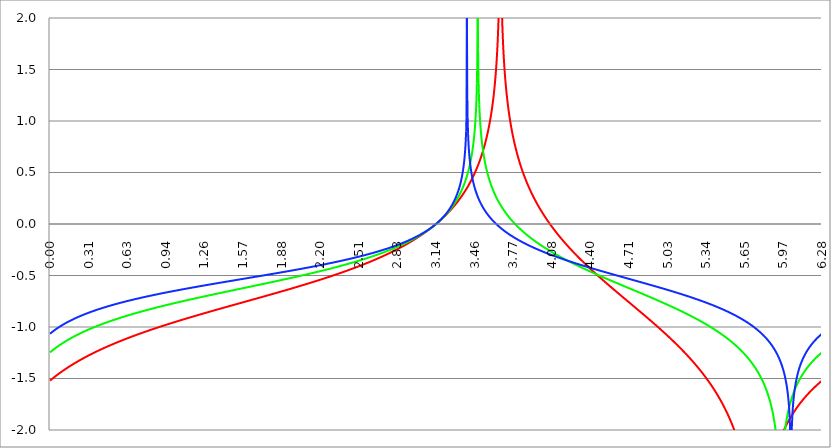
| Category | Series 1 | Series 0 | Series 2 |
|---|---|---|---|
| 0.0 | -1.521 | -1.246 | -1.066 |
| 0.00314159265358979 | -1.518 | -1.243 | -1.062 |
| 0.00628318530717958 | -1.514 | -1.24 | -1.059 |
| 0.00942477796076938 | -1.511 | -1.237 | -1.056 |
| 0.0125663706143592 | -1.508 | -1.234 | -1.053 |
| 0.015707963267949 | -1.505 | -1.231 | -1.05 |
| 0.0188495559215388 | -1.502 | -1.228 | -1.047 |
| 0.0219911485751285 | -1.499 | -1.225 | -1.044 |
| 0.0251327412287183 | -1.496 | -1.222 | -1.042 |
| 0.0282743338823081 | -1.493 | -1.219 | -1.039 |
| 0.0314159265358979 | -1.49 | -1.216 | -1.036 |
| 0.0345575191894877 | -1.487 | -1.214 | -1.033 |
| 0.0376991118430775 | -1.484 | -1.211 | -1.03 |
| 0.0408407044966673 | -1.481 | -1.208 | -1.028 |
| 0.0439822971502571 | -1.479 | -1.205 | -1.025 |
| 0.0471238898038469 | -1.476 | -1.202 | -1.022 |
| 0.0502654824574367 | -1.473 | -1.2 | -1.02 |
| 0.0534070751110265 | -1.47 | -1.197 | -1.017 |
| 0.0565486677646163 | -1.467 | -1.194 | -1.015 |
| 0.059690260418206 | -1.464 | -1.192 | -1.012 |
| 0.0628318530717958 | -1.462 | -1.189 | -1.01 |
| 0.0659734457253856 | -1.459 | -1.186 | -1.007 |
| 0.0691150383789754 | -1.456 | -1.184 | -1.005 |
| 0.0722566310325652 | -1.453 | -1.181 | -1.002 |
| 0.075398223686155 | -1.45 | -1.178 | -1 |
| 0.0785398163397448 | -1.448 | -1.176 | -0.997 |
| 0.0816814089933346 | -1.445 | -1.173 | -0.995 |
| 0.0848230016469244 | -1.442 | -1.171 | -0.993 |
| 0.0879645943005142 | -1.44 | -1.168 | -0.99 |
| 0.091106186954104 | -1.437 | -1.166 | -0.988 |
| 0.0942477796076937 | -1.434 | -1.163 | -0.986 |
| 0.0973893722612835 | -1.432 | -1.161 | -0.983 |
| 0.100530964914873 | -1.429 | -1.159 | -0.981 |
| 0.103672557568463 | -1.426 | -1.156 | -0.979 |
| 0.106814150222053 | -1.424 | -1.154 | -0.977 |
| 0.109955742875643 | -1.421 | -1.151 | -0.974 |
| 0.113097335529233 | -1.419 | -1.149 | -0.972 |
| 0.116238928182822 | -1.416 | -1.147 | -0.97 |
| 0.119380520836412 | -1.414 | -1.144 | -0.968 |
| 0.122522113490002 | -1.411 | -1.142 | -0.966 |
| 0.125663706143592 | -1.409 | -1.14 | -0.964 |
| 0.128805298797181 | -1.406 | -1.138 | -0.962 |
| 0.131946891450771 | -1.404 | -1.135 | -0.96 |
| 0.135088484104361 | -1.401 | -1.133 | -0.958 |
| 0.138230076757951 | -1.399 | -1.131 | -0.955 |
| 0.141371669411541 | -1.396 | -1.129 | -0.953 |
| 0.14451326206513 | -1.394 | -1.126 | -0.951 |
| 0.14765485471872 | -1.391 | -1.124 | -0.949 |
| 0.15079644737231 | -1.389 | -1.122 | -0.948 |
| 0.1539380400259 | -1.386 | -1.12 | -0.946 |
| 0.15707963267949 | -1.384 | -1.118 | -0.944 |
| 0.160221225333079 | -1.382 | -1.116 | -0.942 |
| 0.163362817986669 | -1.379 | -1.113 | -0.94 |
| 0.166504410640259 | -1.377 | -1.111 | -0.938 |
| 0.169646003293849 | -1.375 | -1.109 | -0.936 |
| 0.172787595947439 | -1.372 | -1.107 | -0.934 |
| 0.175929188601028 | -1.37 | -1.105 | -0.932 |
| 0.179070781254618 | -1.368 | -1.103 | -0.93 |
| 0.182212373908208 | -1.365 | -1.101 | -0.929 |
| 0.185353966561798 | -1.363 | -1.099 | -0.927 |
| 0.188495559215388 | -1.361 | -1.097 | -0.925 |
| 0.191637151868977 | -1.358 | -1.095 | -0.923 |
| 0.194778744522567 | -1.356 | -1.093 | -0.921 |
| 0.197920337176157 | -1.354 | -1.091 | -0.92 |
| 0.201061929829747 | -1.352 | -1.089 | -0.918 |
| 0.204203522483336 | -1.349 | -1.087 | -0.916 |
| 0.207345115136926 | -1.347 | -1.085 | -0.914 |
| 0.210486707790516 | -1.345 | -1.083 | -0.913 |
| 0.213628300444106 | -1.343 | -1.081 | -0.911 |
| 0.216769893097696 | -1.341 | -1.079 | -0.909 |
| 0.219911485751285 | -1.338 | -1.077 | -0.908 |
| 0.223053078404875 | -1.336 | -1.076 | -0.906 |
| 0.226194671058465 | -1.334 | -1.074 | -0.904 |
| 0.229336263712055 | -1.332 | -1.072 | -0.903 |
| 0.232477856365645 | -1.33 | -1.07 | -0.901 |
| 0.235619449019234 | -1.328 | -1.068 | -0.899 |
| 0.238761041672824 | -1.325 | -1.066 | -0.898 |
| 0.241902634326414 | -1.323 | -1.064 | -0.896 |
| 0.245044226980004 | -1.321 | -1.063 | -0.895 |
| 0.248185819633594 | -1.319 | -1.061 | -0.893 |
| 0.251327412287183 | -1.317 | -1.059 | -0.891 |
| 0.254469004940773 | -1.315 | -1.057 | -0.89 |
| 0.257610597594363 | -1.313 | -1.055 | -0.888 |
| 0.260752190247953 | -1.311 | -1.054 | -0.887 |
| 0.263893782901543 | -1.309 | -1.052 | -0.885 |
| 0.267035375555132 | -1.307 | -1.05 | -0.884 |
| 0.270176968208722 | -1.304 | -1.048 | -0.882 |
| 0.273318560862312 | -1.302 | -1.047 | -0.881 |
| 0.276460153515902 | -1.3 | -1.045 | -0.879 |
| 0.279601746169492 | -1.298 | -1.043 | -0.878 |
| 0.282743338823082 | -1.296 | -1.041 | -0.876 |
| 0.285884931476671 | -1.294 | -1.04 | -0.875 |
| 0.289026524130261 | -1.292 | -1.038 | -0.873 |
| 0.292168116783851 | -1.29 | -1.036 | -0.872 |
| 0.295309709437441 | -1.288 | -1.035 | -0.87 |
| 0.298451302091031 | -1.286 | -1.033 | -0.869 |
| 0.30159289474462 | -1.284 | -1.031 | -0.867 |
| 0.30473448739821 | -1.282 | -1.03 | -0.866 |
| 0.3078760800518 | -1.28 | -1.028 | -0.864 |
| 0.31101767270539 | -1.278 | -1.026 | -0.863 |
| 0.31415926535898 | -1.277 | -1.025 | -0.862 |
| 0.31730085801257 | -1.275 | -1.023 | -0.86 |
| 0.320442450666159 | -1.273 | -1.021 | -0.859 |
| 0.323584043319749 | -1.271 | -1.02 | -0.857 |
| 0.326725635973339 | -1.269 | -1.018 | -0.856 |
| 0.329867228626929 | -1.267 | -1.017 | -0.855 |
| 0.333008821280519 | -1.265 | -1.015 | -0.853 |
| 0.336150413934108 | -1.263 | -1.013 | -0.852 |
| 0.339292006587698 | -1.261 | -1.012 | -0.851 |
| 0.342433599241288 | -1.259 | -1.01 | -0.849 |
| 0.345575191894878 | -1.257 | -1.009 | -0.848 |
| 0.348716784548468 | -1.256 | -1.007 | -0.847 |
| 0.351858377202058 | -1.254 | -1.006 | -0.845 |
| 0.354999969855647 | -1.252 | -1.004 | -0.844 |
| 0.358141562509237 | -1.25 | -1.003 | -0.843 |
| 0.361283155162827 | -1.248 | -1.001 | -0.841 |
| 0.364424747816417 | -1.246 | -1 | -0.84 |
| 0.367566340470007 | -1.245 | -0.998 | -0.839 |
| 0.370707933123597 | -1.243 | -0.997 | -0.838 |
| 0.373849525777186 | -1.241 | -0.995 | -0.836 |
| 0.376991118430776 | -1.239 | -0.994 | -0.835 |
| 0.380132711084366 | -1.237 | -0.992 | -0.834 |
| 0.383274303737956 | -1.235 | -0.991 | -0.832 |
| 0.386415896391546 | -1.234 | -0.989 | -0.831 |
| 0.389557489045135 | -1.232 | -0.988 | -0.83 |
| 0.392699081698725 | -1.23 | -0.986 | -0.829 |
| 0.395840674352315 | -1.228 | -0.985 | -0.827 |
| 0.398982267005905 | -1.227 | -0.983 | -0.826 |
| 0.402123859659495 | -1.225 | -0.982 | -0.825 |
| 0.405265452313085 | -1.223 | -0.98 | -0.824 |
| 0.408407044966674 | -1.221 | -0.979 | -0.823 |
| 0.411548637620264 | -1.22 | -0.977 | -0.821 |
| 0.414690230273854 | -1.218 | -0.976 | -0.82 |
| 0.417831822927444 | -1.216 | -0.975 | -0.819 |
| 0.420973415581034 | -1.214 | -0.973 | -0.818 |
| 0.424115008234623 | -1.213 | -0.972 | -0.817 |
| 0.427256600888213 | -1.211 | -0.97 | -0.815 |
| 0.430398193541803 | -1.209 | -0.969 | -0.814 |
| 0.433539786195393 | -1.207 | -0.968 | -0.813 |
| 0.436681378848983 | -1.206 | -0.966 | -0.812 |
| 0.439822971502573 | -1.204 | -0.965 | -0.811 |
| 0.442964564156162 | -1.202 | -0.963 | -0.81 |
| 0.446106156809752 | -1.201 | -0.962 | -0.808 |
| 0.449247749463342 | -1.199 | -0.961 | -0.807 |
| 0.452389342116932 | -1.197 | -0.959 | -0.806 |
| 0.455530934770522 | -1.196 | -0.958 | -0.805 |
| 0.458672527424111 | -1.194 | -0.957 | -0.804 |
| 0.461814120077701 | -1.192 | -0.955 | -0.803 |
| 0.464955712731291 | -1.191 | -0.954 | -0.802 |
| 0.468097305384881 | -1.189 | -0.953 | -0.8 |
| 0.471238898038471 | -1.187 | -0.951 | -0.799 |
| 0.474380490692061 | -1.186 | -0.95 | -0.798 |
| 0.47752208334565 | -1.184 | -0.949 | -0.797 |
| 0.48066367599924 | -1.182 | -0.947 | -0.796 |
| 0.48380526865283 | -1.181 | -0.946 | -0.795 |
| 0.48694686130642 | -1.179 | -0.945 | -0.794 |
| 0.49008845396001 | -1.178 | -0.943 | -0.793 |
| 0.493230046613599 | -1.176 | -0.942 | -0.792 |
| 0.496371639267189 | -1.174 | -0.941 | -0.79 |
| 0.499513231920779 | -1.173 | -0.94 | -0.789 |
| 0.502654824574369 | -1.171 | -0.938 | -0.788 |
| 0.505796417227959 | -1.17 | -0.937 | -0.787 |
| 0.508938009881549 | -1.168 | -0.936 | -0.786 |
| 0.512079602535138 | -1.166 | -0.934 | -0.785 |
| 0.515221195188728 | -1.165 | -0.933 | -0.784 |
| 0.518362787842318 | -1.163 | -0.932 | -0.783 |
| 0.521504380495908 | -1.162 | -0.931 | -0.782 |
| 0.524645973149498 | -1.16 | -0.929 | -0.781 |
| 0.527787565803087 | -1.158 | -0.928 | -0.78 |
| 0.530929158456677 | -1.157 | -0.927 | -0.779 |
| 0.534070751110267 | -1.155 | -0.926 | -0.778 |
| 0.537212343763857 | -1.154 | -0.924 | -0.777 |
| 0.540353936417447 | -1.152 | -0.923 | -0.776 |
| 0.543495529071037 | -1.151 | -0.922 | -0.775 |
| 0.546637121724626 | -1.149 | -0.921 | -0.774 |
| 0.549778714378216 | -1.148 | -0.919 | -0.773 |
| 0.552920307031806 | -1.146 | -0.918 | -0.772 |
| 0.556061899685396 | -1.145 | -0.917 | -0.771 |
| 0.559203492338986 | -1.143 | -0.916 | -0.77 |
| 0.562345084992576 | -1.141 | -0.915 | -0.769 |
| 0.565486677646165 | -1.14 | -0.913 | -0.768 |
| 0.568628270299755 | -1.138 | -0.912 | -0.767 |
| 0.571769862953345 | -1.137 | -0.911 | -0.766 |
| 0.574911455606935 | -1.135 | -0.91 | -0.765 |
| 0.578053048260525 | -1.134 | -0.909 | -0.764 |
| 0.581194640914114 | -1.132 | -0.907 | -0.763 |
| 0.584336233567704 | -1.131 | -0.906 | -0.762 |
| 0.587477826221294 | -1.129 | -0.905 | -0.761 |
| 0.590619418874884 | -1.128 | -0.904 | -0.76 |
| 0.593761011528474 | -1.126 | -0.903 | -0.759 |
| 0.596902604182064 | -1.125 | -0.901 | -0.758 |
| 0.600044196835653 | -1.124 | -0.9 | -0.757 |
| 0.603185789489243 | -1.122 | -0.899 | -0.756 |
| 0.606327382142833 | -1.121 | -0.898 | -0.755 |
| 0.609468974796423 | -1.119 | -0.897 | -0.754 |
| 0.612610567450013 | -1.118 | -0.896 | -0.753 |
| 0.615752160103602 | -1.116 | -0.895 | -0.752 |
| 0.618893752757192 | -1.115 | -0.893 | -0.751 |
| 0.622035345410782 | -1.113 | -0.892 | -0.75 |
| 0.625176938064372 | -1.112 | -0.891 | -0.749 |
| 0.628318530717962 | -1.11 | -0.89 | -0.748 |
| 0.631460123371551 | -1.109 | -0.889 | -0.747 |
| 0.634601716025141 | -1.107 | -0.888 | -0.746 |
| 0.637743308678731 | -1.106 | -0.887 | -0.745 |
| 0.640884901332321 | -1.105 | -0.885 | -0.745 |
| 0.644026493985911 | -1.103 | -0.884 | -0.744 |
| 0.647168086639501 | -1.102 | -0.883 | -0.743 |
| 0.65030967929309 | -1.1 | -0.882 | -0.742 |
| 0.65345127194668 | -1.099 | -0.881 | -0.741 |
| 0.65659286460027 | -1.098 | -0.88 | -0.74 |
| 0.65973445725386 | -1.096 | -0.879 | -0.739 |
| 0.66287604990745 | -1.095 | -0.878 | -0.738 |
| 0.666017642561039 | -1.093 | -0.877 | -0.737 |
| 0.669159235214629 | -1.092 | -0.875 | -0.736 |
| 0.672300827868219 | -1.09 | -0.874 | -0.735 |
| 0.675442420521809 | -1.089 | -0.873 | -0.735 |
| 0.678584013175399 | -1.088 | -0.872 | -0.734 |
| 0.681725605828989 | -1.086 | -0.871 | -0.733 |
| 0.684867198482578 | -1.085 | -0.87 | -0.732 |
| 0.688008791136168 | -1.084 | -0.869 | -0.731 |
| 0.691150383789758 | -1.082 | -0.868 | -0.73 |
| 0.694291976443348 | -1.081 | -0.867 | -0.729 |
| 0.697433569096938 | -1.079 | -0.866 | -0.728 |
| 0.700575161750528 | -1.078 | -0.865 | -0.727 |
| 0.703716754404117 | -1.077 | -0.864 | -0.727 |
| 0.706858347057707 | -1.075 | -0.862 | -0.726 |
| 0.709999939711297 | -1.074 | -0.861 | -0.725 |
| 0.713141532364887 | -1.073 | -0.86 | -0.724 |
| 0.716283125018477 | -1.071 | -0.859 | -0.723 |
| 0.719424717672066 | -1.07 | -0.858 | -0.722 |
| 0.722566310325656 | -1.068 | -0.857 | -0.721 |
| 0.725707902979246 | -1.067 | -0.856 | -0.72 |
| 0.728849495632836 | -1.066 | -0.855 | -0.72 |
| 0.731991088286426 | -1.064 | -0.854 | -0.719 |
| 0.735132680940016 | -1.063 | -0.853 | -0.718 |
| 0.738274273593605 | -1.062 | -0.852 | -0.717 |
| 0.741415866247195 | -1.06 | -0.851 | -0.716 |
| 0.744557458900785 | -1.059 | -0.85 | -0.715 |
| 0.747699051554375 | -1.058 | -0.849 | -0.715 |
| 0.750840644207965 | -1.056 | -0.848 | -0.714 |
| 0.753982236861554 | -1.055 | -0.847 | -0.713 |
| 0.757123829515144 | -1.054 | -0.846 | -0.712 |
| 0.760265422168734 | -1.052 | -0.845 | -0.711 |
| 0.763407014822324 | -1.051 | -0.844 | -0.71 |
| 0.766548607475914 | -1.05 | -0.843 | -0.709 |
| 0.769690200129504 | -1.048 | -0.842 | -0.709 |
| 0.772831792783093 | -1.047 | -0.841 | -0.708 |
| 0.775973385436683 | -1.046 | -0.84 | -0.707 |
| 0.779114978090273 | -1.045 | -0.839 | -0.706 |
| 0.782256570743863 | -1.043 | -0.838 | -0.705 |
| 0.785398163397453 | -1.042 | -0.837 | -0.705 |
| 0.788539756051042 | -1.041 | -0.836 | -0.704 |
| 0.791681348704632 | -1.039 | -0.835 | -0.703 |
| 0.794822941358222 | -1.038 | -0.834 | -0.702 |
| 0.797964534011812 | -1.037 | -0.833 | -0.701 |
| 0.801106126665402 | -1.035 | -0.832 | -0.7 |
| 0.804247719318992 | -1.034 | -0.831 | -0.7 |
| 0.807389311972581 | -1.033 | -0.83 | -0.699 |
| 0.810530904626171 | -1.032 | -0.829 | -0.698 |
| 0.813672497279761 | -1.03 | -0.828 | -0.697 |
| 0.816814089933351 | -1.029 | -0.827 | -0.696 |
| 0.819955682586941 | -1.028 | -0.826 | -0.696 |
| 0.823097275240531 | -1.026 | -0.825 | -0.695 |
| 0.82623886789412 | -1.025 | -0.824 | -0.694 |
| 0.82938046054771 | -1.024 | -0.823 | -0.693 |
| 0.8325220532013 | -1.023 | -0.822 | -0.692 |
| 0.83566364585489 | -1.021 | -0.821 | -0.692 |
| 0.83880523850848 | -1.02 | -0.82 | -0.691 |
| 0.841946831162069 | -1.019 | -0.819 | -0.69 |
| 0.845088423815659 | -1.018 | -0.818 | -0.689 |
| 0.848230016469249 | -1.016 | -0.817 | -0.688 |
| 0.851371609122839 | -1.015 | -0.816 | -0.688 |
| 0.854513201776429 | -1.014 | -0.815 | -0.687 |
| 0.857654794430019 | -1.013 | -0.814 | -0.686 |
| 0.860796387083608 | -1.011 | -0.813 | -0.685 |
| 0.863937979737198 | -1.01 | -0.812 | -0.685 |
| 0.867079572390788 | -1.009 | -0.811 | -0.684 |
| 0.870221165044378 | -1.008 | -0.81 | -0.683 |
| 0.873362757697968 | -1.006 | -0.809 | -0.682 |
| 0.876504350351557 | -1.005 | -0.808 | -0.681 |
| 0.879645943005147 | -1.004 | -0.807 | -0.681 |
| 0.882787535658737 | -1.003 | -0.806 | -0.68 |
| 0.885929128312327 | -1.001 | -0.805 | -0.679 |
| 0.889070720965917 | -1 | -0.804 | -0.678 |
| 0.892212313619507 | -0.999 | -0.804 | -0.678 |
| 0.895353906273096 | -0.998 | -0.803 | -0.677 |
| 0.898495498926686 | -0.997 | -0.802 | -0.676 |
| 0.901637091580276 | -0.995 | -0.801 | -0.675 |
| 0.904778684233866 | -0.994 | -0.8 | -0.675 |
| 0.907920276887456 | -0.993 | -0.799 | -0.674 |
| 0.911061869541045 | -0.992 | -0.798 | -0.673 |
| 0.914203462194635 | -0.99 | -0.797 | -0.672 |
| 0.917345054848225 | -0.989 | -0.796 | -0.672 |
| 0.920486647501815 | -0.988 | -0.795 | -0.671 |
| 0.923628240155405 | -0.987 | -0.794 | -0.67 |
| 0.926769832808995 | -0.986 | -0.793 | -0.669 |
| 0.929911425462584 | -0.984 | -0.792 | -0.669 |
| 0.933053018116174 | -0.983 | -0.791 | -0.668 |
| 0.936194610769764 | -0.982 | -0.79 | -0.667 |
| 0.939336203423354 | -0.981 | -0.79 | -0.666 |
| 0.942477796076944 | -0.98 | -0.789 | -0.666 |
| 0.945619388730533 | -0.978 | -0.788 | -0.665 |
| 0.948760981384123 | -0.977 | -0.787 | -0.664 |
| 0.951902574037713 | -0.976 | -0.786 | -0.663 |
| 0.955044166691303 | -0.975 | -0.785 | -0.663 |
| 0.958185759344893 | -0.974 | -0.784 | -0.662 |
| 0.961327351998483 | -0.972 | -0.783 | -0.661 |
| 0.964468944652072 | -0.971 | -0.782 | -0.66 |
| 0.967610537305662 | -0.97 | -0.781 | -0.66 |
| 0.970752129959252 | -0.969 | -0.78 | -0.659 |
| 0.973893722612842 | -0.968 | -0.78 | -0.658 |
| 0.977035315266432 | -0.966 | -0.779 | -0.658 |
| 0.980176907920022 | -0.965 | -0.778 | -0.657 |
| 0.983318500573611 | -0.964 | -0.777 | -0.656 |
| 0.986460093227201 | -0.963 | -0.776 | -0.655 |
| 0.989601685880791 | -0.962 | -0.775 | -0.655 |
| 0.992743278534381 | -0.961 | -0.774 | -0.654 |
| 0.995884871187971 | -0.959 | -0.773 | -0.653 |
| 0.99902646384156 | -0.958 | -0.772 | -0.652 |
| 1.00216805649515 | -0.957 | -0.771 | -0.652 |
| 1.00530964914874 | -0.956 | -0.771 | -0.651 |
| 1.00845124180233 | -0.955 | -0.77 | -0.65 |
| 1.01159283445592 | -0.954 | -0.769 | -0.65 |
| 1.01473442710951 | -0.952 | -0.768 | -0.649 |
| 1.017876019763099 | -0.951 | -0.767 | -0.648 |
| 1.021017612416689 | -0.95 | -0.766 | -0.647 |
| 1.02415920507028 | -0.949 | -0.765 | -0.647 |
| 1.027300797723869 | -0.948 | -0.764 | -0.646 |
| 1.030442390377459 | -0.947 | -0.764 | -0.645 |
| 1.033583983031048 | -0.945 | -0.763 | -0.645 |
| 1.036725575684638 | -0.944 | -0.762 | -0.644 |
| 1.039867168338228 | -0.943 | -0.761 | -0.643 |
| 1.043008760991818 | -0.942 | -0.76 | -0.642 |
| 1.046150353645408 | -0.941 | -0.759 | -0.642 |
| 1.049291946298998 | -0.94 | -0.758 | -0.641 |
| 1.052433538952587 | -0.939 | -0.757 | -0.64 |
| 1.055575131606177 | -0.937 | -0.757 | -0.64 |
| 1.058716724259767 | -0.936 | -0.756 | -0.639 |
| 1.061858316913357 | -0.935 | -0.755 | -0.638 |
| 1.064999909566947 | -0.934 | -0.754 | -0.638 |
| 1.068141502220536 | -0.933 | -0.753 | -0.637 |
| 1.071283094874126 | -0.932 | -0.752 | -0.636 |
| 1.074424687527716 | -0.931 | -0.751 | -0.635 |
| 1.077566280181306 | -0.929 | -0.75 | -0.635 |
| 1.080707872834896 | -0.928 | -0.75 | -0.634 |
| 1.083849465488486 | -0.927 | -0.749 | -0.633 |
| 1.086991058142075 | -0.926 | -0.748 | -0.633 |
| 1.090132650795665 | -0.925 | -0.747 | -0.632 |
| 1.093274243449255 | -0.924 | -0.746 | -0.631 |
| 1.096415836102845 | -0.923 | -0.745 | -0.631 |
| 1.099557428756435 | -0.921 | -0.744 | -0.63 |
| 1.102699021410025 | -0.92 | -0.744 | -0.629 |
| 1.105840614063614 | -0.919 | -0.743 | -0.629 |
| 1.108982206717204 | -0.918 | -0.742 | -0.628 |
| 1.112123799370794 | -0.917 | -0.741 | -0.627 |
| 1.115265392024384 | -0.916 | -0.74 | -0.627 |
| 1.118406984677974 | -0.915 | -0.739 | -0.626 |
| 1.121548577331563 | -0.914 | -0.738 | -0.625 |
| 1.124690169985153 | -0.912 | -0.738 | -0.624 |
| 1.127831762638743 | -0.911 | -0.737 | -0.624 |
| 1.130973355292333 | -0.91 | -0.736 | -0.623 |
| 1.134114947945923 | -0.909 | -0.735 | -0.622 |
| 1.137256540599513 | -0.908 | -0.734 | -0.622 |
| 1.140398133253102 | -0.907 | -0.733 | -0.621 |
| 1.143539725906692 | -0.906 | -0.733 | -0.62 |
| 1.146681318560282 | -0.905 | -0.732 | -0.62 |
| 1.149822911213872 | -0.904 | -0.731 | -0.619 |
| 1.152964503867462 | -0.902 | -0.73 | -0.618 |
| 1.156106096521051 | -0.901 | -0.729 | -0.618 |
| 1.159247689174641 | -0.9 | -0.728 | -0.617 |
| 1.162389281828231 | -0.899 | -0.728 | -0.616 |
| 1.165530874481821 | -0.898 | -0.727 | -0.616 |
| 1.168672467135411 | -0.897 | -0.726 | -0.615 |
| 1.171814059789001 | -0.896 | -0.725 | -0.614 |
| 1.17495565244259 | -0.895 | -0.724 | -0.614 |
| 1.17809724509618 | -0.894 | -0.723 | -0.613 |
| 1.18123883774977 | -0.892 | -0.723 | -0.612 |
| 1.18438043040336 | -0.891 | -0.722 | -0.612 |
| 1.18752202305695 | -0.89 | -0.721 | -0.611 |
| 1.190663615710539 | -0.889 | -0.72 | -0.61 |
| 1.193805208364129 | -0.888 | -0.719 | -0.61 |
| 1.19694680101772 | -0.887 | -0.718 | -0.609 |
| 1.200088393671309 | -0.886 | -0.718 | -0.608 |
| 1.203229986324899 | -0.885 | -0.717 | -0.608 |
| 1.206371578978489 | -0.884 | -0.716 | -0.607 |
| 1.209513171632078 | -0.883 | -0.715 | -0.606 |
| 1.212654764285668 | -0.881 | -0.714 | -0.606 |
| 1.215796356939258 | -0.88 | -0.713 | -0.605 |
| 1.218937949592848 | -0.879 | -0.713 | -0.604 |
| 1.222079542246438 | -0.878 | -0.712 | -0.604 |
| 1.225221134900027 | -0.877 | -0.711 | -0.603 |
| 1.228362727553617 | -0.876 | -0.71 | -0.602 |
| 1.231504320207207 | -0.875 | -0.709 | -0.602 |
| 1.234645912860797 | -0.874 | -0.708 | -0.601 |
| 1.237787505514387 | -0.873 | -0.708 | -0.6 |
| 1.240929098167977 | -0.872 | -0.707 | -0.6 |
| 1.244070690821566 | -0.871 | -0.706 | -0.599 |
| 1.247212283475156 | -0.869 | -0.705 | -0.598 |
| 1.250353876128746 | -0.868 | -0.704 | -0.598 |
| 1.253495468782336 | -0.867 | -0.704 | -0.597 |
| 1.256637061435926 | -0.866 | -0.703 | -0.596 |
| 1.259778654089515 | -0.865 | -0.702 | -0.596 |
| 1.262920246743105 | -0.864 | -0.701 | -0.595 |
| 1.266061839396695 | -0.863 | -0.7 | -0.594 |
| 1.269203432050285 | -0.862 | -0.699 | -0.594 |
| 1.272345024703875 | -0.861 | -0.699 | -0.593 |
| 1.275486617357465 | -0.86 | -0.698 | -0.593 |
| 1.278628210011054 | -0.859 | -0.697 | -0.592 |
| 1.281769802664644 | -0.858 | -0.696 | -0.591 |
| 1.284911395318234 | -0.857 | -0.695 | -0.591 |
| 1.288052987971824 | -0.855 | -0.695 | -0.59 |
| 1.291194580625414 | -0.854 | -0.694 | -0.589 |
| 1.294336173279003 | -0.853 | -0.693 | -0.589 |
| 1.297477765932593 | -0.852 | -0.692 | -0.588 |
| 1.300619358586183 | -0.851 | -0.691 | -0.587 |
| 1.303760951239773 | -0.85 | -0.691 | -0.587 |
| 1.306902543893363 | -0.849 | -0.69 | -0.586 |
| 1.310044136546953 | -0.848 | -0.689 | -0.585 |
| 1.313185729200542 | -0.847 | -0.688 | -0.585 |
| 1.316327321854132 | -0.846 | -0.687 | -0.584 |
| 1.319468914507722 | -0.845 | -0.687 | -0.583 |
| 1.322610507161312 | -0.844 | -0.686 | -0.583 |
| 1.325752099814902 | -0.843 | -0.685 | -0.582 |
| 1.328893692468491 | -0.842 | -0.684 | -0.582 |
| 1.332035285122081 | -0.84 | -0.683 | -0.581 |
| 1.335176877775671 | -0.839 | -0.683 | -0.58 |
| 1.338318470429261 | -0.838 | -0.682 | -0.58 |
| 1.341460063082851 | -0.837 | -0.681 | -0.579 |
| 1.344601655736441 | -0.836 | -0.68 | -0.578 |
| 1.34774324839003 | -0.835 | -0.679 | -0.578 |
| 1.35088484104362 | -0.834 | -0.679 | -0.577 |
| 1.35402643369721 | -0.833 | -0.678 | -0.576 |
| 1.3571680263508 | -0.832 | -0.677 | -0.576 |
| 1.36030961900439 | -0.831 | -0.676 | -0.575 |
| 1.363451211657979 | -0.83 | -0.675 | -0.574 |
| 1.36659280431157 | -0.829 | -0.675 | -0.574 |
| 1.369734396965159 | -0.828 | -0.674 | -0.573 |
| 1.372875989618749 | -0.827 | -0.673 | -0.573 |
| 1.376017582272339 | -0.826 | -0.672 | -0.572 |
| 1.379159174925929 | -0.824 | -0.671 | -0.571 |
| 1.382300767579518 | -0.823 | -0.671 | -0.571 |
| 1.385442360233108 | -0.822 | -0.67 | -0.57 |
| 1.388583952886698 | -0.821 | -0.669 | -0.569 |
| 1.391725545540288 | -0.82 | -0.668 | -0.569 |
| 1.394867138193878 | -0.819 | -0.667 | -0.568 |
| 1.398008730847468 | -0.818 | -0.667 | -0.567 |
| 1.401150323501057 | -0.817 | -0.666 | -0.567 |
| 1.404291916154647 | -0.816 | -0.665 | -0.566 |
| 1.407433508808237 | -0.815 | -0.664 | -0.566 |
| 1.410575101461827 | -0.814 | -0.663 | -0.565 |
| 1.413716694115417 | -0.813 | -0.663 | -0.564 |
| 1.416858286769006 | -0.812 | -0.662 | -0.564 |
| 1.419999879422596 | -0.811 | -0.661 | -0.563 |
| 1.423141472076186 | -0.81 | -0.66 | -0.562 |
| 1.426283064729776 | -0.809 | -0.659 | -0.562 |
| 1.429424657383366 | -0.808 | -0.659 | -0.561 |
| 1.432566250036956 | -0.807 | -0.658 | -0.56 |
| 1.435707842690545 | -0.805 | -0.657 | -0.56 |
| 1.438849435344135 | -0.804 | -0.656 | -0.559 |
| 1.441991027997725 | -0.803 | -0.655 | -0.559 |
| 1.445132620651315 | -0.802 | -0.655 | -0.558 |
| 1.448274213304905 | -0.801 | -0.654 | -0.557 |
| 1.451415805958494 | -0.8 | -0.653 | -0.557 |
| 1.454557398612084 | -0.799 | -0.652 | -0.556 |
| 1.457698991265674 | -0.798 | -0.652 | -0.555 |
| 1.460840583919264 | -0.797 | -0.651 | -0.555 |
| 1.463982176572854 | -0.796 | -0.65 | -0.554 |
| 1.467123769226444 | -0.795 | -0.649 | -0.554 |
| 1.470265361880033 | -0.794 | -0.648 | -0.553 |
| 1.473406954533623 | -0.793 | -0.648 | -0.552 |
| 1.476548547187213 | -0.792 | -0.647 | -0.552 |
| 1.479690139840803 | -0.791 | -0.646 | -0.551 |
| 1.482831732494393 | -0.79 | -0.645 | -0.55 |
| 1.485973325147982 | -0.789 | -0.644 | -0.55 |
| 1.489114917801572 | -0.788 | -0.644 | -0.549 |
| 1.492256510455162 | -0.787 | -0.643 | -0.548 |
| 1.495398103108752 | -0.785 | -0.642 | -0.548 |
| 1.498539695762342 | -0.784 | -0.641 | -0.547 |
| 1.501681288415932 | -0.783 | -0.641 | -0.547 |
| 1.504822881069521 | -0.782 | -0.64 | -0.546 |
| 1.507964473723111 | -0.781 | -0.639 | -0.545 |
| 1.511106066376701 | -0.78 | -0.638 | -0.545 |
| 1.514247659030291 | -0.779 | -0.637 | -0.544 |
| 1.517389251683881 | -0.778 | -0.637 | -0.543 |
| 1.520530844337471 | -0.777 | -0.636 | -0.543 |
| 1.52367243699106 | -0.776 | -0.635 | -0.542 |
| 1.52681402964465 | -0.775 | -0.634 | -0.542 |
| 1.52995562229824 | -0.774 | -0.633 | -0.541 |
| 1.53309721495183 | -0.773 | -0.633 | -0.54 |
| 1.53623880760542 | -0.772 | -0.632 | -0.54 |
| 1.539380400259009 | -0.771 | -0.631 | -0.539 |
| 1.542521992912599 | -0.77 | -0.63 | -0.538 |
| 1.545663585566189 | -0.769 | -0.63 | -0.538 |
| 1.548805178219779 | -0.768 | -0.629 | -0.537 |
| 1.551946770873369 | -0.767 | -0.628 | -0.537 |
| 1.555088363526959 | -0.766 | -0.627 | -0.536 |
| 1.558229956180548 | -0.765 | -0.626 | -0.535 |
| 1.561371548834138 | -0.763 | -0.626 | -0.535 |
| 1.564513141487728 | -0.762 | -0.625 | -0.534 |
| 1.567654734141318 | -0.761 | -0.624 | -0.533 |
| 1.570796326794908 | -0.76 | -0.623 | -0.533 |
| 1.573937919448497 | -0.759 | -0.622 | -0.532 |
| 1.577079512102087 | -0.758 | -0.622 | -0.532 |
| 1.580221104755677 | -0.757 | -0.621 | -0.531 |
| 1.583362697409267 | -0.756 | -0.62 | -0.53 |
| 1.586504290062857 | -0.755 | -0.619 | -0.53 |
| 1.589645882716447 | -0.754 | -0.619 | -0.529 |
| 1.592787475370036 | -0.753 | -0.618 | -0.528 |
| 1.595929068023626 | -0.752 | -0.617 | -0.528 |
| 1.599070660677216 | -0.751 | -0.616 | -0.527 |
| 1.602212253330806 | -0.75 | -0.615 | -0.526 |
| 1.605353845984396 | -0.749 | -0.615 | -0.526 |
| 1.608495438637985 | -0.748 | -0.614 | -0.525 |
| 1.611637031291575 | -0.747 | -0.613 | -0.525 |
| 1.614778623945165 | -0.746 | -0.612 | -0.524 |
| 1.617920216598755 | -0.745 | -0.611 | -0.523 |
| 1.621061809252345 | -0.744 | -0.611 | -0.523 |
| 1.624203401905935 | -0.743 | -0.61 | -0.522 |
| 1.627344994559524 | -0.741 | -0.609 | -0.521 |
| 1.630486587213114 | -0.74 | -0.608 | -0.521 |
| 1.633628179866704 | -0.739 | -0.608 | -0.52 |
| 1.636769772520294 | -0.738 | -0.607 | -0.52 |
| 1.639911365173884 | -0.737 | -0.606 | -0.519 |
| 1.643052957827473 | -0.736 | -0.605 | -0.518 |
| 1.646194550481063 | -0.735 | -0.604 | -0.518 |
| 1.649336143134653 | -0.734 | -0.604 | -0.517 |
| 1.652477735788243 | -0.733 | -0.603 | -0.516 |
| 1.655619328441833 | -0.732 | -0.602 | -0.516 |
| 1.658760921095423 | -0.731 | -0.601 | -0.515 |
| 1.661902513749012 | -0.73 | -0.6 | -0.515 |
| 1.665044106402602 | -0.729 | -0.6 | -0.514 |
| 1.668185699056192 | -0.728 | -0.599 | -0.513 |
| 1.671327291709782 | -0.727 | -0.598 | -0.513 |
| 1.674468884363372 | -0.726 | -0.597 | -0.512 |
| 1.677610477016961 | -0.725 | -0.596 | -0.511 |
| 1.680752069670551 | -0.724 | -0.596 | -0.511 |
| 1.683893662324141 | -0.723 | -0.595 | -0.51 |
| 1.687035254977731 | -0.722 | -0.594 | -0.509 |
| 1.690176847631321 | -0.72 | -0.593 | -0.509 |
| 1.693318440284911 | -0.719 | -0.593 | -0.508 |
| 1.6964600329385 | -0.718 | -0.592 | -0.508 |
| 1.69960162559209 | -0.717 | -0.591 | -0.507 |
| 1.70274321824568 | -0.716 | -0.59 | -0.506 |
| 1.70588481089927 | -0.715 | -0.589 | -0.506 |
| 1.70902640355286 | -0.714 | -0.589 | -0.505 |
| 1.712167996206449 | -0.713 | -0.588 | -0.504 |
| 1.715309588860039 | -0.712 | -0.587 | -0.504 |
| 1.71845118151363 | -0.711 | -0.586 | -0.503 |
| 1.721592774167219 | -0.71 | -0.585 | -0.503 |
| 1.724734366820809 | -0.709 | -0.585 | -0.502 |
| 1.727875959474399 | -0.708 | -0.584 | -0.501 |
| 1.731017552127988 | -0.707 | -0.583 | -0.501 |
| 1.734159144781578 | -0.706 | -0.582 | -0.5 |
| 1.737300737435168 | -0.705 | -0.581 | -0.499 |
| 1.740442330088758 | -0.704 | -0.581 | -0.499 |
| 1.743583922742348 | -0.703 | -0.58 | -0.498 |
| 1.746725515395937 | -0.702 | -0.579 | -0.497 |
| 1.749867108049527 | -0.7 | -0.578 | -0.497 |
| 1.753008700703117 | -0.699 | -0.577 | -0.496 |
| 1.756150293356707 | -0.698 | -0.577 | -0.496 |
| 1.759291886010297 | -0.697 | -0.576 | -0.495 |
| 1.762433478663887 | -0.696 | -0.575 | -0.494 |
| 1.765575071317476 | -0.695 | -0.574 | -0.494 |
| 1.768716663971066 | -0.694 | -0.574 | -0.493 |
| 1.771858256624656 | -0.693 | -0.573 | -0.492 |
| 1.774999849278246 | -0.692 | -0.572 | -0.492 |
| 1.778141441931836 | -0.691 | -0.571 | -0.491 |
| 1.781283034585426 | -0.69 | -0.57 | -0.49 |
| 1.784424627239015 | -0.689 | -0.57 | -0.49 |
| 1.787566219892605 | -0.688 | -0.569 | -0.489 |
| 1.790707812546195 | -0.687 | -0.568 | -0.489 |
| 1.793849405199785 | -0.686 | -0.567 | -0.488 |
| 1.796990997853375 | -0.685 | -0.566 | -0.487 |
| 1.800132590506964 | -0.683 | -0.566 | -0.487 |
| 1.803274183160554 | -0.682 | -0.565 | -0.486 |
| 1.806415775814144 | -0.681 | -0.564 | -0.485 |
| 1.809557368467734 | -0.68 | -0.563 | -0.485 |
| 1.812698961121324 | -0.679 | -0.562 | -0.484 |
| 1.815840553774914 | -0.678 | -0.561 | -0.483 |
| 1.818982146428503 | -0.677 | -0.561 | -0.483 |
| 1.822123739082093 | -0.676 | -0.56 | -0.482 |
| 1.825265331735683 | -0.675 | -0.559 | -0.481 |
| 1.828406924389273 | -0.674 | -0.558 | -0.481 |
| 1.831548517042863 | -0.673 | -0.557 | -0.48 |
| 1.834690109696452 | -0.672 | -0.557 | -0.48 |
| 1.837831702350042 | -0.671 | -0.556 | -0.479 |
| 1.840973295003632 | -0.67 | -0.555 | -0.478 |
| 1.844114887657222 | -0.668 | -0.554 | -0.478 |
| 1.847256480310812 | -0.667 | -0.553 | -0.477 |
| 1.850398072964402 | -0.666 | -0.553 | -0.476 |
| 1.853539665617991 | -0.665 | -0.552 | -0.476 |
| 1.856681258271581 | -0.664 | -0.551 | -0.475 |
| 1.859822850925171 | -0.663 | -0.55 | -0.474 |
| 1.862964443578761 | -0.662 | -0.549 | -0.474 |
| 1.866106036232351 | -0.661 | -0.549 | -0.473 |
| 1.86924762888594 | -0.66 | -0.548 | -0.472 |
| 1.87238922153953 | -0.659 | -0.547 | -0.472 |
| 1.87553081419312 | -0.658 | -0.546 | -0.471 |
| 1.87867240684671 | -0.657 | -0.545 | -0.47 |
| 1.8818139995003 | -0.656 | -0.545 | -0.47 |
| 1.88495559215389 | -0.654 | -0.544 | -0.469 |
| 1.888097184807479 | -0.653 | -0.543 | -0.468 |
| 1.891238777461069 | -0.652 | -0.542 | -0.468 |
| 1.89438037011466 | -0.651 | -0.541 | -0.467 |
| 1.897521962768249 | -0.65 | -0.54 | -0.466 |
| 1.900663555421839 | -0.649 | -0.54 | -0.466 |
| 1.903805148075429 | -0.648 | -0.539 | -0.465 |
| 1.906946740729018 | -0.647 | -0.538 | -0.465 |
| 1.910088333382608 | -0.646 | -0.537 | -0.464 |
| 1.913229926036198 | -0.645 | -0.536 | -0.463 |
| 1.916371518689788 | -0.644 | -0.536 | -0.463 |
| 1.919513111343378 | -0.643 | -0.535 | -0.462 |
| 1.922654703996967 | -0.641 | -0.534 | -0.461 |
| 1.925796296650557 | -0.64 | -0.533 | -0.461 |
| 1.928937889304147 | -0.639 | -0.532 | -0.46 |
| 1.932079481957737 | -0.638 | -0.531 | -0.459 |
| 1.935221074611327 | -0.637 | -0.531 | -0.459 |
| 1.938362667264917 | -0.636 | -0.53 | -0.458 |
| 1.941504259918506 | -0.635 | -0.529 | -0.457 |
| 1.944645852572096 | -0.634 | -0.528 | -0.457 |
| 1.947787445225686 | -0.633 | -0.527 | -0.456 |
| 1.950929037879276 | -0.632 | -0.526 | -0.455 |
| 1.954070630532866 | -0.63 | -0.526 | -0.455 |
| 1.957212223186455 | -0.629 | -0.525 | -0.454 |
| 1.960353815840045 | -0.628 | -0.524 | -0.453 |
| 1.963495408493635 | -0.627 | -0.523 | -0.453 |
| 1.966637001147225 | -0.626 | -0.522 | -0.452 |
| 1.969778593800815 | -0.625 | -0.521 | -0.451 |
| 1.972920186454405 | -0.624 | -0.521 | -0.451 |
| 1.976061779107994 | -0.623 | -0.52 | -0.45 |
| 1.979203371761584 | -0.622 | -0.519 | -0.449 |
| 1.982344964415174 | -0.621 | -0.518 | -0.449 |
| 1.985486557068764 | -0.619 | -0.517 | -0.448 |
| 1.988628149722354 | -0.618 | -0.516 | -0.447 |
| 1.991769742375943 | -0.617 | -0.516 | -0.447 |
| 1.994911335029533 | -0.616 | -0.515 | -0.446 |
| 1.998052927683123 | -0.615 | -0.514 | -0.445 |
| 2.001194520336712 | -0.614 | -0.513 | -0.444 |
| 2.004336112990302 | -0.613 | -0.512 | -0.444 |
| 2.007477705643892 | -0.612 | -0.511 | -0.443 |
| 2.010619298297482 | -0.61 | -0.511 | -0.442 |
| 2.013760890951071 | -0.609 | -0.51 | -0.442 |
| 2.016902483604661 | -0.608 | -0.509 | -0.441 |
| 2.02004407625825 | -0.607 | -0.508 | -0.44 |
| 2.02318566891184 | -0.606 | -0.507 | -0.44 |
| 2.02632726156543 | -0.605 | -0.506 | -0.439 |
| 2.029468854219019 | -0.604 | -0.505 | -0.438 |
| 2.032610446872609 | -0.603 | -0.505 | -0.438 |
| 2.035752039526198 | -0.602 | -0.504 | -0.437 |
| 2.038893632179788 | -0.6 | -0.503 | -0.436 |
| 2.042035224833378 | -0.599 | -0.502 | -0.436 |
| 2.045176817486967 | -0.598 | -0.501 | -0.435 |
| 2.048318410140557 | -0.597 | -0.5 | -0.434 |
| 2.051460002794146 | -0.596 | -0.499 | -0.434 |
| 2.054601595447736 | -0.595 | -0.499 | -0.433 |
| 2.057743188101325 | -0.594 | -0.498 | -0.432 |
| 2.060884780754915 | -0.592 | -0.497 | -0.431 |
| 2.064026373408505 | -0.591 | -0.496 | -0.431 |
| 2.067167966062094 | -0.59 | -0.495 | -0.43 |
| 2.070309558715684 | -0.589 | -0.494 | -0.429 |
| 2.073451151369273 | -0.588 | -0.493 | -0.429 |
| 2.076592744022863 | -0.587 | -0.493 | -0.428 |
| 2.079734336676452 | -0.586 | -0.492 | -0.427 |
| 2.082875929330042 | -0.584 | -0.491 | -0.427 |
| 2.086017521983632 | -0.583 | -0.49 | -0.426 |
| 2.089159114637221 | -0.582 | -0.489 | -0.425 |
| 2.092300707290811 | -0.581 | -0.488 | -0.424 |
| 2.095442299944401 | -0.58 | -0.487 | -0.424 |
| 2.09858389259799 | -0.579 | -0.486 | -0.423 |
| 2.10172548525158 | -0.578 | -0.486 | -0.422 |
| 2.104867077905169 | -0.576 | -0.485 | -0.422 |
| 2.108008670558759 | -0.575 | -0.484 | -0.421 |
| 2.111150263212349 | -0.574 | -0.483 | -0.42 |
| 2.114291855865938 | -0.573 | -0.482 | -0.42 |
| 2.117433448519528 | -0.572 | -0.481 | -0.419 |
| 2.120575041173117 | -0.571 | -0.48 | -0.418 |
| 2.123716633826707 | -0.569 | -0.479 | -0.417 |
| 2.126858226480297 | -0.568 | -0.479 | -0.417 |
| 2.129999819133886 | -0.567 | -0.478 | -0.416 |
| 2.133141411787476 | -0.566 | -0.477 | -0.415 |
| 2.136283004441065 | -0.565 | -0.476 | -0.415 |
| 2.139424597094655 | -0.564 | -0.475 | -0.414 |
| 2.142566189748245 | -0.562 | -0.474 | -0.413 |
| 2.145707782401834 | -0.561 | -0.473 | -0.412 |
| 2.148849375055424 | -0.56 | -0.472 | -0.412 |
| 2.151990967709013 | -0.559 | -0.471 | -0.411 |
| 2.155132560362603 | -0.558 | -0.471 | -0.41 |
| 2.158274153016193 | -0.557 | -0.47 | -0.409 |
| 2.161415745669782 | -0.555 | -0.469 | -0.409 |
| 2.164557338323372 | -0.554 | -0.468 | -0.408 |
| 2.167698930976961 | -0.553 | -0.467 | -0.407 |
| 2.170840523630551 | -0.552 | -0.466 | -0.407 |
| 2.173982116284141 | -0.551 | -0.465 | -0.406 |
| 2.17712370893773 | -0.549 | -0.464 | -0.405 |
| 2.18026530159132 | -0.548 | -0.463 | -0.404 |
| 2.183406894244909 | -0.547 | -0.462 | -0.404 |
| 2.186548486898499 | -0.546 | -0.461 | -0.403 |
| 2.189690079552089 | -0.545 | -0.461 | -0.402 |
| 2.192831672205678 | -0.544 | -0.46 | -0.401 |
| 2.195973264859268 | -0.542 | -0.459 | -0.401 |
| 2.199114857512857 | -0.541 | -0.458 | -0.4 |
| 2.202256450166447 | -0.54 | -0.457 | -0.399 |
| 2.205398042820036 | -0.539 | -0.456 | -0.398 |
| 2.208539635473626 | -0.538 | -0.455 | -0.398 |
| 2.211681228127216 | -0.536 | -0.454 | -0.397 |
| 2.214822820780805 | -0.535 | -0.453 | -0.396 |
| 2.217964413434395 | -0.534 | -0.452 | -0.395 |
| 2.221106006087984 | -0.533 | -0.451 | -0.395 |
| 2.224247598741574 | -0.531 | -0.45 | -0.394 |
| 2.227389191395164 | -0.53 | -0.45 | -0.393 |
| 2.230530784048753 | -0.529 | -0.449 | -0.392 |
| 2.233672376702343 | -0.528 | -0.448 | -0.392 |
| 2.236813969355933 | -0.527 | -0.447 | -0.391 |
| 2.239955562009522 | -0.525 | -0.446 | -0.39 |
| 2.243097154663112 | -0.524 | -0.445 | -0.389 |
| 2.246238747316701 | -0.523 | -0.444 | -0.389 |
| 2.249380339970291 | -0.522 | -0.443 | -0.388 |
| 2.252521932623881 | -0.52 | -0.442 | -0.387 |
| 2.25566352527747 | -0.519 | -0.441 | -0.386 |
| 2.25880511793106 | -0.518 | -0.44 | -0.386 |
| 2.261946710584649 | -0.517 | -0.439 | -0.385 |
| 2.265088303238239 | -0.516 | -0.438 | -0.384 |
| 2.268229895891829 | -0.514 | -0.437 | -0.383 |
| 2.271371488545418 | -0.513 | -0.436 | -0.383 |
| 2.274513081199008 | -0.512 | -0.435 | -0.382 |
| 2.277654673852597 | -0.511 | -0.434 | -0.381 |
| 2.280796266506186 | -0.509 | -0.433 | -0.38 |
| 2.283937859159776 | -0.508 | -0.432 | -0.379 |
| 2.287079451813366 | -0.507 | -0.432 | -0.379 |
| 2.290221044466955 | -0.506 | -0.431 | -0.378 |
| 2.293362637120545 | -0.504 | -0.43 | -0.377 |
| 2.296504229774135 | -0.503 | -0.429 | -0.376 |
| 2.299645822427724 | -0.502 | -0.428 | -0.376 |
| 2.302787415081314 | -0.501 | -0.427 | -0.375 |
| 2.305929007734904 | -0.499 | -0.426 | -0.374 |
| 2.309070600388493 | -0.498 | -0.425 | -0.373 |
| 2.312212193042083 | -0.497 | -0.424 | -0.372 |
| 2.315353785695672 | -0.495 | -0.423 | -0.372 |
| 2.318495378349262 | -0.494 | -0.422 | -0.371 |
| 2.321636971002852 | -0.493 | -0.421 | -0.37 |
| 2.324778563656441 | -0.492 | -0.42 | -0.369 |
| 2.327920156310031 | -0.49 | -0.419 | -0.368 |
| 2.33106174896362 | -0.489 | -0.418 | -0.368 |
| 2.33420334161721 | -0.488 | -0.417 | -0.367 |
| 2.3373449342708 | -0.487 | -0.416 | -0.366 |
| 2.340486526924389 | -0.485 | -0.415 | -0.365 |
| 2.343628119577979 | -0.484 | -0.414 | -0.364 |
| 2.346769712231568 | -0.483 | -0.413 | -0.363 |
| 2.349911304885158 | -0.481 | -0.412 | -0.363 |
| 2.353052897538748 | -0.48 | -0.411 | -0.362 |
| 2.356194490192337 | -0.479 | -0.41 | -0.361 |
| 2.359336082845927 | -0.477 | -0.409 | -0.36 |
| 2.362477675499516 | -0.476 | -0.408 | -0.359 |
| 2.365619268153106 | -0.475 | -0.407 | -0.359 |
| 2.368760860806696 | -0.474 | -0.406 | -0.358 |
| 2.371902453460285 | -0.472 | -0.405 | -0.357 |
| 2.375044046113875 | -0.471 | -0.404 | -0.356 |
| 2.378185638767464 | -0.47 | -0.403 | -0.355 |
| 2.381327231421054 | -0.468 | -0.402 | -0.354 |
| 2.384468824074644 | -0.467 | -0.401 | -0.354 |
| 2.387610416728233 | -0.466 | -0.4 | -0.353 |
| 2.390752009381823 | -0.464 | -0.399 | -0.352 |
| 2.393893602035412 | -0.463 | -0.398 | -0.351 |
| 2.397035194689002 | -0.462 | -0.397 | -0.35 |
| 2.400176787342591 | -0.46 | -0.396 | -0.349 |
| 2.403318379996181 | -0.459 | -0.395 | -0.348 |
| 2.406459972649771 | -0.458 | -0.393 | -0.348 |
| 2.40960156530336 | -0.456 | -0.392 | -0.347 |
| 2.41274315795695 | -0.455 | -0.391 | -0.346 |
| 2.41588475061054 | -0.454 | -0.39 | -0.345 |
| 2.419026343264129 | -0.452 | -0.389 | -0.344 |
| 2.422167935917719 | -0.451 | -0.388 | -0.343 |
| 2.425309528571308 | -0.45 | -0.387 | -0.342 |
| 2.428451121224898 | -0.448 | -0.386 | -0.342 |
| 2.431592713878488 | -0.447 | -0.385 | -0.341 |
| 2.434734306532077 | -0.445 | -0.384 | -0.34 |
| 2.437875899185667 | -0.444 | -0.383 | -0.339 |
| 2.441017491839256 | -0.443 | -0.382 | -0.338 |
| 2.444159084492846 | -0.441 | -0.381 | -0.337 |
| 2.447300677146435 | -0.44 | -0.38 | -0.336 |
| 2.450442269800025 | -0.439 | -0.379 | -0.335 |
| 2.453583862453615 | -0.437 | -0.378 | -0.335 |
| 2.456725455107204 | -0.436 | -0.376 | -0.334 |
| 2.459867047760794 | -0.434 | -0.375 | -0.333 |
| 2.463008640414384 | -0.433 | -0.374 | -0.332 |
| 2.466150233067973 | -0.432 | -0.373 | -0.331 |
| 2.469291825721563 | -0.43 | -0.372 | -0.33 |
| 2.472433418375152 | -0.429 | -0.371 | -0.329 |
| 2.475575011028742 | -0.427 | -0.37 | -0.328 |
| 2.478716603682332 | -0.426 | -0.369 | -0.327 |
| 2.481858196335921 | -0.425 | -0.368 | -0.327 |
| 2.48499978898951 | -0.423 | -0.367 | -0.326 |
| 2.4881413816431 | -0.422 | -0.365 | -0.325 |
| 2.49128297429669 | -0.42 | -0.364 | -0.324 |
| 2.49442456695028 | -0.419 | -0.363 | -0.323 |
| 2.497566159603869 | -0.417 | -0.362 | -0.322 |
| 2.500707752257458 | -0.416 | -0.361 | -0.321 |
| 2.503849344911048 | -0.415 | -0.36 | -0.32 |
| 2.506990937564638 | -0.413 | -0.359 | -0.319 |
| 2.510132530218228 | -0.412 | -0.358 | -0.318 |
| 2.513274122871817 | -0.41 | -0.356 | -0.317 |
| 2.516415715525407 | -0.409 | -0.355 | -0.316 |
| 2.519557308178996 | -0.407 | -0.354 | -0.315 |
| 2.522698900832586 | -0.406 | -0.353 | -0.314 |
| 2.525840493486176 | -0.405 | -0.352 | -0.313 |
| 2.528982086139765 | -0.403 | -0.351 | -0.313 |
| 2.532123678793355 | -0.402 | -0.35 | -0.312 |
| 2.535265271446944 | -0.4 | -0.348 | -0.311 |
| 2.538406864100534 | -0.399 | -0.347 | -0.31 |
| 2.541548456754124 | -0.397 | -0.346 | -0.309 |
| 2.544690049407713 | -0.396 | -0.345 | -0.308 |
| 2.547831642061302 | -0.394 | -0.344 | -0.307 |
| 2.550973234714892 | -0.393 | -0.343 | -0.306 |
| 2.554114827368482 | -0.391 | -0.341 | -0.305 |
| 2.557256420022072 | -0.39 | -0.34 | -0.304 |
| 2.560398012675661 | -0.388 | -0.339 | -0.303 |
| 2.563539605329251 | -0.387 | -0.338 | -0.302 |
| 2.56668119798284 | -0.385 | -0.337 | -0.301 |
| 2.56982279063643 | -0.384 | -0.335 | -0.3 |
| 2.57296438329002 | -0.382 | -0.334 | -0.299 |
| 2.576105975943609 | -0.381 | -0.333 | -0.298 |
| 2.579247568597199 | -0.379 | -0.332 | -0.297 |
| 2.582389161250788 | -0.378 | -0.331 | -0.296 |
| 2.585530753904377 | -0.376 | -0.329 | -0.295 |
| 2.588672346557967 | -0.375 | -0.328 | -0.294 |
| 2.591813939211557 | -0.373 | -0.327 | -0.293 |
| 2.594955531865147 | -0.372 | -0.326 | -0.292 |
| 2.598097124518736 | -0.37 | -0.325 | -0.291 |
| 2.601238717172326 | -0.368 | -0.323 | -0.29 |
| 2.604380309825915 | -0.367 | -0.322 | -0.289 |
| 2.607521902479505 | -0.365 | -0.321 | -0.288 |
| 2.610663495133095 | -0.364 | -0.32 | -0.287 |
| 2.613805087786684 | -0.362 | -0.318 | -0.286 |
| 2.616946680440274 | -0.361 | -0.317 | -0.285 |
| 2.620088273093863 | -0.359 | -0.316 | -0.284 |
| 2.623229865747452 | -0.358 | -0.315 | -0.283 |
| 2.626371458401042 | -0.356 | -0.313 | -0.281 |
| 2.629513051054632 | -0.354 | -0.312 | -0.28 |
| 2.632654643708222 | -0.353 | -0.311 | -0.279 |
| 2.635796236361811 | -0.351 | -0.31 | -0.278 |
| 2.638937829015401 | -0.35 | -0.308 | -0.277 |
| 2.642079421668991 | -0.348 | -0.307 | -0.276 |
| 2.64522101432258 | -0.346 | -0.306 | -0.275 |
| 2.64836260697617 | -0.345 | -0.304 | -0.274 |
| 2.651504199629759 | -0.343 | -0.303 | -0.273 |
| 2.654645792283349 | -0.342 | -0.302 | -0.272 |
| 2.657787384936938 | -0.34 | -0.3 | -0.271 |
| 2.660928977590528 | -0.338 | -0.299 | -0.27 |
| 2.664070570244118 | -0.337 | -0.298 | -0.268 |
| 2.667212162897707 | -0.335 | -0.296 | -0.267 |
| 2.670353755551297 | -0.333 | -0.295 | -0.266 |
| 2.673495348204887 | -0.332 | -0.294 | -0.265 |
| 2.676636940858476 | -0.33 | -0.292 | -0.264 |
| 2.679778533512066 | -0.328 | -0.291 | -0.263 |
| 2.682920126165655 | -0.327 | -0.29 | -0.262 |
| 2.686061718819245 | -0.325 | -0.288 | -0.261 |
| 2.689203311472835 | -0.323 | -0.287 | -0.259 |
| 2.692344904126424 | -0.322 | -0.286 | -0.258 |
| 2.695486496780014 | -0.32 | -0.284 | -0.257 |
| 2.698628089433603 | -0.318 | -0.283 | -0.256 |
| 2.701769682087193 | -0.317 | -0.282 | -0.255 |
| 2.704911274740782 | -0.315 | -0.28 | -0.254 |
| 2.708052867394372 | -0.313 | -0.279 | -0.253 |
| 2.711194460047962 | -0.312 | -0.277 | -0.251 |
| 2.714336052701551 | -0.31 | -0.276 | -0.25 |
| 2.717477645355141 | -0.308 | -0.275 | -0.249 |
| 2.720619238008731 | -0.306 | -0.273 | -0.248 |
| 2.72376083066232 | -0.305 | -0.272 | -0.247 |
| 2.72690242331591 | -0.303 | -0.27 | -0.245 |
| 2.730044015969499 | -0.301 | -0.269 | -0.244 |
| 2.733185608623089 | -0.299 | -0.268 | -0.243 |
| 2.736327201276678 | -0.298 | -0.266 | -0.242 |
| 2.739468793930268 | -0.296 | -0.265 | -0.241 |
| 2.742610386583858 | -0.294 | -0.263 | -0.239 |
| 2.745751979237447 | -0.292 | -0.262 | -0.238 |
| 2.748893571891036 | -0.291 | -0.26 | -0.237 |
| 2.752035164544627 | -0.289 | -0.259 | -0.236 |
| 2.755176757198216 | -0.287 | -0.257 | -0.234 |
| 2.758318349851806 | -0.285 | -0.256 | -0.233 |
| 2.761459942505395 | -0.283 | -0.254 | -0.232 |
| 2.764601535158985 | -0.282 | -0.253 | -0.231 |
| 2.767743127812574 | -0.28 | -0.251 | -0.229 |
| 2.770884720466164 | -0.278 | -0.25 | -0.228 |
| 2.774026313119754 | -0.276 | -0.248 | -0.227 |
| 2.777167905773343 | -0.274 | -0.247 | -0.225 |
| 2.780309498426932 | -0.272 | -0.245 | -0.224 |
| 2.783451091080522 | -0.271 | -0.244 | -0.223 |
| 2.786592683734112 | -0.269 | -0.242 | -0.222 |
| 2.789734276387701 | -0.267 | -0.241 | -0.22 |
| 2.792875869041291 | -0.265 | -0.239 | -0.219 |
| 2.796017461694881 | -0.263 | -0.238 | -0.218 |
| 2.79915905434847 | -0.261 | -0.236 | -0.216 |
| 2.80230064700206 | -0.259 | -0.235 | -0.215 |
| 2.80544223965565 | -0.258 | -0.233 | -0.214 |
| 2.808583832309239 | -0.256 | -0.231 | -0.212 |
| 2.811725424962829 | -0.254 | -0.23 | -0.211 |
| 2.814867017616419 | -0.252 | -0.228 | -0.209 |
| 2.818008610270008 | -0.25 | -0.227 | -0.208 |
| 2.821150202923598 | -0.248 | -0.225 | -0.207 |
| 2.824291795577187 | -0.246 | -0.223 | -0.205 |
| 2.827433388230777 | -0.244 | -0.222 | -0.204 |
| 2.830574980884366 | -0.242 | -0.22 | -0.202 |
| 2.833716573537956 | -0.24 | -0.218 | -0.201 |
| 2.836858166191546 | -0.238 | -0.217 | -0.2 |
| 2.839999758845135 | -0.236 | -0.215 | -0.198 |
| 2.843141351498725 | -0.234 | -0.213 | -0.197 |
| 2.846282944152314 | -0.232 | -0.212 | -0.195 |
| 2.849424536805904 | -0.23 | -0.21 | -0.194 |
| 2.852566129459494 | -0.228 | -0.208 | -0.192 |
| 2.855707722113083 | -0.226 | -0.207 | -0.191 |
| 2.858849314766673 | -0.224 | -0.205 | -0.189 |
| 2.861990907420262 | -0.222 | -0.203 | -0.188 |
| 2.865132500073852 | -0.22 | -0.202 | -0.186 |
| 2.868274092727442 | -0.218 | -0.2 | -0.185 |
| 2.871415685381031 | -0.216 | -0.198 | -0.183 |
| 2.874557278034621 | -0.214 | -0.196 | -0.182 |
| 2.87769887068821 | -0.212 | -0.195 | -0.18 |
| 2.8808404633418 | -0.21 | -0.193 | -0.179 |
| 2.88398205599539 | -0.208 | -0.191 | -0.177 |
| 2.88712364864898 | -0.206 | -0.189 | -0.176 |
| 2.890265241302569 | -0.204 | -0.187 | -0.174 |
| 2.893406833956158 | -0.202 | -0.186 | -0.173 |
| 2.896548426609748 | -0.2 | -0.184 | -0.171 |
| 2.899690019263338 | -0.197 | -0.182 | -0.169 |
| 2.902831611916927 | -0.195 | -0.18 | -0.168 |
| 2.905973204570517 | -0.193 | -0.178 | -0.166 |
| 2.909114797224106 | -0.191 | -0.177 | -0.165 |
| 2.912256389877696 | -0.189 | -0.175 | -0.163 |
| 2.915397982531286 | -0.187 | -0.173 | -0.161 |
| 2.918539575184875 | -0.185 | -0.171 | -0.16 |
| 2.921681167838465 | -0.182 | -0.169 | -0.158 |
| 2.924822760492054 | -0.18 | -0.167 | -0.156 |
| 2.927964353145644 | -0.178 | -0.165 | -0.155 |
| 2.931105945799234 | -0.176 | -0.163 | -0.153 |
| 2.934247538452823 | -0.174 | -0.161 | -0.151 |
| 2.937389131106413 | -0.171 | -0.159 | -0.149 |
| 2.940530723760002 | -0.169 | -0.157 | -0.148 |
| 2.943672316413592 | -0.167 | -0.155 | -0.146 |
| 2.946813909067182 | -0.165 | -0.153 | -0.144 |
| 2.949955501720771 | -0.162 | -0.151 | -0.142 |
| 2.953097094374361 | -0.16 | -0.149 | -0.141 |
| 2.95623868702795 | -0.158 | -0.147 | -0.139 |
| 2.95938027968154 | -0.155 | -0.145 | -0.137 |
| 2.96252187233513 | -0.153 | -0.143 | -0.135 |
| 2.965663464988719 | -0.151 | -0.141 | -0.133 |
| 2.968805057642309 | -0.148 | -0.139 | -0.131 |
| 2.971946650295898 | -0.146 | -0.137 | -0.13 |
| 2.975088242949488 | -0.144 | -0.135 | -0.128 |
| 2.978229835603078 | -0.141 | -0.133 | -0.126 |
| 2.981371428256667 | -0.139 | -0.131 | -0.124 |
| 2.984513020910257 | -0.137 | -0.129 | -0.122 |
| 2.987654613563846 | -0.134 | -0.127 | -0.12 |
| 2.990796206217436 | -0.132 | -0.124 | -0.118 |
| 2.993937798871025 | -0.129 | -0.122 | -0.116 |
| 2.997079391524615 | -0.127 | -0.12 | -0.114 |
| 3.000220984178205 | -0.125 | -0.118 | -0.112 |
| 3.003362576831794 | -0.122 | -0.116 | -0.11 |
| 3.006504169485384 | -0.12 | -0.113 | -0.108 |
| 3.009645762138974 | -0.117 | -0.111 | -0.106 |
| 3.012787354792563 | -0.115 | -0.109 | -0.104 |
| 3.015928947446153 | -0.112 | -0.107 | -0.102 |
| 3.019070540099742 | -0.11 | -0.104 | -0.1 |
| 3.022212132753332 | -0.107 | -0.102 | -0.098 |
| 3.025353725406922 | -0.105 | -0.1 | -0.095 |
| 3.028495318060511 | -0.102 | -0.097 | -0.093 |
| 3.031636910714101 | -0.099 | -0.095 | -0.091 |
| 3.03477850336769 | -0.097 | -0.093 | -0.089 |
| 3.03792009602128 | -0.094 | -0.09 | -0.087 |
| 3.04106168867487 | -0.092 | -0.088 | -0.085 |
| 3.04420328132846 | -0.089 | -0.085 | -0.082 |
| 3.047344873982049 | -0.086 | -0.083 | -0.08 |
| 3.050486466635638 | -0.084 | -0.081 | -0.078 |
| 3.053628059289228 | -0.081 | -0.078 | -0.075 |
| 3.056769651942818 | -0.078 | -0.076 | -0.073 |
| 3.059911244596407 | -0.076 | -0.073 | -0.071 |
| 3.063052837249997 | -0.073 | -0.071 | -0.068 |
| 3.066194429903586 | -0.07 | -0.068 | -0.066 |
| 3.069336022557176 | -0.067 | -0.065 | -0.063 |
| 3.072477615210766 | -0.065 | -0.063 | -0.061 |
| 3.075619207864355 | -0.062 | -0.06 | -0.059 |
| 3.078760800517945 | -0.059 | -0.058 | -0.056 |
| 3.081902393171534 | -0.056 | -0.055 | -0.054 |
| 3.085043985825124 | -0.054 | -0.052 | -0.051 |
| 3.088185578478713 | -0.051 | -0.05 | -0.048 |
| 3.091327171132303 | -0.048 | -0.047 | -0.046 |
| 3.094468763785893 | -0.045 | -0.044 | -0.043 |
| 3.097610356439482 | -0.042 | -0.041 | -0.041 |
| 3.100751949093072 | -0.039 | -0.039 | -0.038 |
| 3.103893541746661 | -0.036 | -0.036 | -0.035 |
| 3.107035134400251 | -0.033 | -0.033 | -0.032 |
| 3.110176727053841 | -0.03 | -0.03 | -0.03 |
| 3.11331831970743 | -0.028 | -0.027 | -0.027 |
| 3.11645991236102 | -0.025 | -0.024 | -0.024 |
| 3.11960150501461 | -0.022 | -0.021 | -0.021 |
| 3.122743097668199 | -0.019 | -0.018 | -0.018 |
| 3.125884690321789 | -0.015 | -0.015 | -0.015 |
| 3.129026282975378 | -0.012 | -0.012 | -0.012 |
| 3.132167875628968 | -0.009 | -0.009 | -0.009 |
| 3.135309468282557 | -0.006 | -0.006 | -0.006 |
| 3.138451060936147 | -0.003 | -0.003 | -0.003 |
| 3.141592653589737 | 0 | 0 | 0 |
| 3.144734246243326 | 0.003 | 0.003 | 0.003 |
| 3.147875838896916 | 0.006 | 0.006 | 0.006 |
| 3.151017431550505 | 0.01 | 0.01 | 0.01 |
| 3.154159024204095 | 0.013 | 0.013 | 0.013 |
| 3.157300616857685 | 0.016 | 0.016 | 0.016 |
| 3.160442209511274 | 0.019 | 0.019 | 0.02 |
| 3.163583802164864 | 0.022 | 0.023 | 0.023 |
| 3.166725394818453 | 0.026 | 0.026 | 0.026 |
| 3.169866987472043 | 0.029 | 0.03 | 0.03 |
| 3.173008580125633 | 0.032 | 0.033 | 0.034 |
| 3.176150172779222 | 0.036 | 0.036 | 0.037 |
| 3.179291765432812 | 0.039 | 0.04 | 0.041 |
| 3.182433358086401 | 0.043 | 0.044 | 0.045 |
| 3.185574950739991 | 0.046 | 0.047 | 0.048 |
| 3.188716543393581 | 0.049 | 0.051 | 0.052 |
| 3.19185813604717 | 0.053 | 0.054 | 0.056 |
| 3.19499972870076 | 0.056 | 0.058 | 0.06 |
| 3.198141321354349 | 0.06 | 0.062 | 0.064 |
| 3.20128291400794 | 0.064 | 0.066 | 0.068 |
| 3.204424506661528 | 0.067 | 0.07 | 0.072 |
| 3.207566099315118 | 0.071 | 0.074 | 0.077 |
| 3.210707691968708 | 0.074 | 0.077 | 0.081 |
| 3.213849284622297 | 0.078 | 0.081 | 0.085 |
| 3.216990877275887 | 0.082 | 0.085 | 0.09 |
| 3.220132469929476 | 0.085 | 0.09 | 0.094 |
| 3.223274062583066 | 0.089 | 0.094 | 0.099 |
| 3.226415655236656 | 0.093 | 0.098 | 0.104 |
| 3.229557247890245 | 0.097 | 0.102 | 0.108 |
| 3.232698840543835 | 0.101 | 0.106 | 0.113 |
| 3.235840433197425 | 0.104 | 0.111 | 0.118 |
| 3.238982025851014 | 0.108 | 0.115 | 0.123 |
| 3.242123618504604 | 0.112 | 0.12 | 0.129 |
| 3.245265211158193 | 0.116 | 0.124 | 0.134 |
| 3.248406803811783 | 0.12 | 0.129 | 0.139 |
| 3.251548396465373 | 0.124 | 0.133 | 0.145 |
| 3.254689989118962 | 0.128 | 0.138 | 0.15 |
| 3.257831581772551 | 0.132 | 0.143 | 0.156 |
| 3.260973174426141 | 0.136 | 0.148 | 0.162 |
| 3.26411476707973 | 0.141 | 0.153 | 0.168 |
| 3.267256359733321 | 0.145 | 0.158 | 0.174 |
| 3.27039795238691 | 0.149 | 0.163 | 0.181 |
| 3.2735395450405 | 0.153 | 0.168 | 0.187 |
| 3.276681137694089 | 0.157 | 0.173 | 0.194 |
| 3.279822730347679 | 0.162 | 0.178 | 0.201 |
| 3.282964323001269 | 0.166 | 0.184 | 0.208 |
| 3.286105915654858 | 0.17 | 0.189 | 0.215 |
| 3.289247508308448 | 0.175 | 0.195 | 0.223 |
| 3.292389100962037 | 0.179 | 0.201 | 0.231 |
| 3.295530693615627 | 0.184 | 0.206 | 0.239 |
| 3.298672286269217 | 0.188 | 0.212 | 0.247 |
| 3.301813878922806 | 0.193 | 0.218 | 0.256 |
| 3.304955471576396 | 0.198 | 0.224 | 0.264 |
| 3.308097064229985 | 0.202 | 0.23 | 0.273 |
| 3.311238656883575 | 0.207 | 0.237 | 0.283 |
| 3.314380249537165 | 0.212 | 0.243 | 0.293 |
| 3.317521842190754 | 0.217 | 0.25 | 0.303 |
| 3.320663434844344 | 0.222 | 0.256 | 0.314 |
| 3.323805027497933 | 0.226 | 0.263 | 0.325 |
| 3.326946620151523 | 0.231 | 0.27 | 0.337 |
| 3.330088212805113 | 0.236 | 0.277 | 0.349 |
| 3.333229805458702 | 0.241 | 0.285 | 0.362 |
| 3.336371398112292 | 0.247 | 0.292 | 0.375 |
| 3.339512990765881 | 0.252 | 0.3 | 0.39 |
| 3.342654583419471 | 0.257 | 0.307 | 0.405 |
| 3.345796176073061 | 0.262 | 0.315 | 0.421 |
| 3.34893776872665 | 0.267 | 0.323 | 0.438 |
| 3.35207936138024 | 0.273 | 0.332 | 0.457 |
| 3.355220954033829 | 0.278 | 0.34 | 0.476 |
| 3.358362546687419 | 0.284 | 0.349 | 0.498 |
| 3.361504139341009 | 0.289 | 0.358 | 0.522 |
| 3.364645731994598 | 0.295 | 0.367 | 0.547 |
| 3.367787324648188 | 0.301 | 0.377 | 0.576 |
| 3.370928917301777 | 0.306 | 0.386 | 0.609 |
| 3.374070509955367 | 0.312 | 0.396 | 0.646 |
| 3.377212102608956 | 0.318 | 0.407 | 0.69 |
| 3.380353695262546 | 0.324 | 0.417 | 0.742 |
| 3.383495287916136 | 0.33 | 0.428 | 0.808 |
| 3.386636880569725 | 0.336 | 0.44 | 0.897 |
| 3.389778473223315 | 0.342 | 0.451 | 1.034 |
| 3.392920065876904 | 0.348 | 0.464 | 2.1 |
| 3.396061658530494 | 0.355 | 0.476 | 1.271 |
| 3.399203251184084 | 0.361 | 0.489 | 1.009 |
| 3.402344843837673 | 0.367 | 0.503 | 0.882 |
| 3.405486436491263 | 0.374 | 0.517 | 0.797 |
| 3.408628029144852 | 0.381 | 0.532 | 0.733 |
| 3.411769621798442 | 0.387 | 0.547 | 0.682 |
| 3.414911214452032 | 0.394 | 0.563 | 0.639 |
| 3.418052807105621 | 0.401 | 0.58 | 0.602 |
| 3.421194399759211 | 0.408 | 0.598 | 0.57 |
| 3.4243359924128 | 0.415 | 0.617 | 0.542 |
| 3.42747758506639 | 0.422 | 0.637 | 0.516 |
| 3.43061917771998 | 0.429 | 0.658 | 0.492 |
| 3.433760770373569 | 0.437 | 0.68 | 0.471 |
| 3.436902363027159 | 0.444 | 0.704 | 0.451 |
| 3.440043955680748 | 0.452 | 0.73 | 0.433 |
| 3.443185548334338 | 0.459 | 0.757 | 0.415 |
| 3.446327140987927 | 0.467 | 0.787 | 0.399 |
| 3.449468733641517 | 0.475 | 0.82 | 0.384 |
| 3.452610326295107 | 0.483 | 0.857 | 0.37 |
| 3.455751918948696 | 0.491 | 0.897 | 0.356 |
| 3.458893511602286 | 0.5 | 0.943 | 0.343 |
| 3.462035104255876 | 0.508 | 0.996 | 0.33 |
| 3.465176696909465 | 0.517 | 1.058 | 0.319 |
| 3.468318289563055 | 0.525 | 1.134 | 0.307 |
| 3.471459882216644 | 0.534 | 1.231 | 0.297 |
| 3.474601474870234 | 0.543 | 1.365 | 0.286 |
| 3.477743067523824 | 0.552 | 1.582 | 0.276 |
| 3.480884660177413 | 0.562 | 2.258 | 0.266 |
| 3.484026252831002 | 0.571 | 1.706 | 0.257 |
| 3.487167845484592 | 0.581 | 1.425 | 0.248 |
| 3.490309438138182 | 0.591 | 1.271 | 0.239 |
| 3.493451030791772 | 0.601 | 1.163 | 0.231 |
| 3.496592623445361 | 0.611 | 1.081 | 0.223 |
| 3.499734216098951 | 0.621 | 1.014 | 0.215 |
| 3.50287580875254 | 0.632 | 0.958 | 0.207 |
| 3.50601740140613 | 0.643 | 0.91 | 0.2 |
| 3.50915899405972 | 0.654 | 0.867 | 0.192 |
| 3.512300586713309 | 0.665 | 0.829 | 0.185 |
| 3.515442179366899 | 0.676 | 0.794 | 0.178 |
| 3.518583772020488 | 0.688 | 0.763 | 0.172 |
| 3.521725364674078 | 0.7 | 0.734 | 0.165 |
| 3.524866957327668 | 0.713 | 0.707 | 0.159 |
| 3.528008549981257 | 0.725 | 0.682 | 0.152 |
| 3.531150142634847 | 0.738 | 0.659 | 0.146 |
| 3.534291735288436 | 0.751 | 0.637 | 0.14 |
| 3.537433327942026 | 0.765 | 0.616 | 0.134 |
| 3.540574920595616 | 0.779 | 0.597 | 0.129 |
| 3.543716513249205 | 0.793 | 0.578 | 0.123 |
| 3.546858105902795 | 0.808 | 0.561 | 0.118 |
| 3.549999698556384 | 0.823 | 0.544 | 0.112 |
| 3.553141291209974 | 0.838 | 0.528 | 0.107 |
| 3.556282883863564 | 0.854 | 0.513 | 0.102 |
| 3.559424476517153 | 0.871 | 0.498 | 0.097 |
| 3.562566069170743 | 0.888 | 0.484 | 0.092 |
| 3.565707661824332 | 0.905 | 0.47 | 0.087 |
| 3.568849254477922 | 0.923 | 0.457 | 0.082 |
| 3.571990847131511 | 0.942 | 0.444 | 0.077 |
| 3.575132439785101 | 0.961 | 0.432 | 0.073 |
| 3.578274032438691 | 0.981 | 0.42 | 0.068 |
| 3.58141562509228 | 1.002 | 0.409 | 0.063 |
| 3.58455721774587 | 1.023 | 0.397 | 0.059 |
| 3.58769881039946 | 1.046 | 0.387 | 0.055 |
| 3.590840403053049 | 1.069 | 0.376 | 0.05 |
| 3.593981995706639 | 1.094 | 0.366 | 0.046 |
| 3.597123588360228 | 1.119 | 0.356 | 0.042 |
| 3.600265181013818 | 1.146 | 0.346 | 0.038 |
| 3.603406773667407 | 1.174 | 0.337 | 0.034 |
| 3.606548366320997 | 1.204 | 0.327 | 0.03 |
| 3.609689958974587 | 1.235 | 0.319 | 0.026 |
| 3.612831551628176 | 1.268 | 0.31 | 0.022 |
| 3.615973144281766 | 1.304 | 0.301 | 0.018 |
| 3.619114736935355 | 1.341 | 0.293 | 0.014 |
| 3.622256329588945 | 1.381 | 0.285 | 0.011 |
| 3.625397922242534 | 1.425 | 0.277 | 0.007 |
| 3.628539514896124 | 1.472 | 0.269 | 0.003 |
| 3.631681107549714 | 1.523 | 0.261 | 0 |
| 3.634822700203303 | 1.579 | 0.253 | -0.004 |
| 3.637964292856893 | 1.642 | 0.246 | -0.007 |
| 3.641105885510483 | 1.712 | 0.239 | -0.011 |
| 3.644247478164072 | 1.792 | 0.232 | -0.014 |
| 3.647389070817662 | 1.886 | 0.225 | -0.017 |
| 3.650530663471251 | 1.997 | 0.218 | -0.021 |
| 3.653672256124841 | 2.136 | 0.211 | -0.024 |
| 3.656813848778431 | 2.319 | 0.204 | -0.027 |
| 3.65995544143202 | 2.59 | 0.198 | -0.03 |
| 3.66309703408561 | 3.119 | 0.191 | -0.034 |
| 3.666238626739199 | 3.518 | 0.185 | -0.037 |
| 3.66938021939279 | 2.717 | 0.179 | -0.04 |
| 3.672521812046378 | 2.394 | 0.173 | -0.043 |
| 3.675663404699968 | 2.187 | 0.167 | -0.046 |
| 3.678804997353558 | 2.035 | 0.161 | -0.049 |
| 3.681946590007147 | 1.915 | 0.155 | -0.052 |
| 3.685088182660737 | 1.815 | 0.149 | -0.055 |
| 3.688229775314326 | 1.73 | 0.144 | -0.058 |
| 3.691371367967916 | 1.656 | 0.138 | -0.061 |
| 3.694512960621506 | 1.59 | 0.133 | -0.064 |
| 3.697654553275095 | 1.53 | 0.127 | -0.067 |
| 3.700796145928685 | 1.476 | 0.122 | -0.069 |
| 3.703937738582274 | 1.427 | 0.117 | -0.072 |
| 3.707079331235864 | 1.381 | 0.111 | -0.075 |
| 3.710220923889454 | 1.339 | 0.106 | -0.078 |
| 3.713362516543043 | 1.3 | 0.101 | -0.08 |
| 3.716504109196633 | 1.263 | 0.096 | -0.083 |
| 3.719645701850223 | 1.228 | 0.091 | -0.086 |
| 3.722787294503812 | 1.195 | 0.086 | -0.088 |
| 3.725928887157402 | 1.164 | 0.082 | -0.091 |
| 3.729070479810991 | 1.134 | 0.077 | -0.094 |
| 3.732212072464581 | 1.106 | 0.072 | -0.096 |
| 3.735353665118171 | 1.079 | 0.067 | -0.099 |
| 3.73849525777176 | 1.053 | 0.063 | -0.101 |
| 3.74163685042535 | 1.028 | 0.058 | -0.104 |
| 3.744778443078939 | 1.004 | 0.054 | -0.106 |
| 3.747920035732529 | 0.981 | 0.049 | -0.109 |
| 3.751061628386119 | 0.959 | 0.045 | -0.111 |
| 3.754203221039708 | 0.938 | 0.041 | -0.114 |
| 3.757344813693298 | 0.917 | 0.036 | -0.116 |
| 3.760486406346887 | 0.897 | 0.032 | -0.118 |
| 3.763627999000477 | 0.878 | 0.028 | -0.121 |
| 3.766769591654067 | 0.859 | 0.024 | -0.123 |
| 3.769911184307656 | 0.841 | 0.019 | -0.125 |
| 3.773052776961246 | 0.824 | 0.015 | -0.128 |
| 3.776194369614835 | 0.807 | 0.011 | -0.13 |
| 3.779335962268425 | 0.79 | 0.007 | -0.132 |
| 3.782477554922014 | 0.774 | 0.003 | -0.135 |
| 3.785619147575604 | 0.758 | -0.001 | -0.137 |
| 3.788760740229193 | 0.742 | -0.005 | -0.139 |
| 3.791902332882783 | 0.727 | -0.008 | -0.141 |
| 3.795043925536373 | 0.712 | -0.012 | -0.143 |
| 3.798185518189962 | 0.698 | -0.016 | -0.146 |
| 3.801327110843552 | 0.684 | -0.02 | -0.148 |
| 3.804468703497142 | 0.67 | -0.024 | -0.15 |
| 3.807610296150731 | 0.657 | -0.027 | -0.152 |
| 3.810751888804321 | 0.644 | -0.031 | -0.154 |
| 3.813893481457911 | 0.631 | -0.035 | -0.156 |
| 3.8170350741115 | 0.618 | -0.038 | -0.158 |
| 3.82017666676509 | 0.606 | -0.042 | -0.161 |
| 3.823318259418679 | 0.593 | -0.045 | -0.163 |
| 3.826459852072269 | 0.581 | -0.049 | -0.165 |
| 3.829601444725859 | 0.57 | -0.052 | -0.167 |
| 3.832743037379448 | 0.558 | -0.056 | -0.169 |
| 3.835884630033038 | 0.547 | -0.059 | -0.171 |
| 3.839026222686627 | 0.536 | -0.063 | -0.173 |
| 3.842167815340217 | 0.525 | -0.066 | -0.175 |
| 3.845309407993807 | 0.514 | -0.069 | -0.177 |
| 3.848451000647396 | 0.503 | -0.073 | -0.179 |
| 3.851592593300986 | 0.493 | -0.076 | -0.181 |
| 3.854734185954575 | 0.483 | -0.079 | -0.183 |
| 3.857875778608165 | 0.473 | -0.082 | -0.185 |
| 3.861017371261755 | 0.463 | -0.086 | -0.187 |
| 3.864158963915344 | 0.453 | -0.089 | -0.188 |
| 3.867300556568933 | 0.443 | -0.092 | -0.19 |
| 3.870442149222523 | 0.434 | -0.095 | -0.192 |
| 3.873583741876112 | 0.424 | -0.098 | -0.194 |
| 3.876725334529703 | 0.415 | -0.101 | -0.196 |
| 3.879866927183292 | 0.406 | -0.105 | -0.198 |
| 3.883008519836882 | 0.397 | -0.108 | -0.2 |
| 3.886150112490471 | 0.388 | -0.111 | -0.202 |
| 3.889291705144061 | 0.379 | -0.114 | -0.203 |
| 3.892433297797651 | 0.37 | -0.117 | -0.205 |
| 3.89557489045124 | 0.362 | -0.12 | -0.207 |
| 3.89871648310483 | 0.353 | -0.123 | -0.209 |
| 3.901858075758419 | 0.345 | -0.126 | -0.211 |
| 3.904999668412009 | 0.337 | -0.129 | -0.212 |
| 3.908141261065598 | 0.329 | -0.131 | -0.214 |
| 3.911282853719188 | 0.321 | -0.134 | -0.216 |
| 3.914424446372778 | 0.313 | -0.137 | -0.218 |
| 3.917566039026367 | 0.305 | -0.14 | -0.219 |
| 3.920707631679957 | 0.297 | -0.143 | -0.221 |
| 3.923849224333547 | 0.289 | -0.146 | -0.223 |
| 3.926990816987136 | 0.282 | -0.149 | -0.225 |
| 3.930132409640726 | 0.274 | -0.151 | -0.226 |
| 3.933274002294315 | 0.267 | -0.154 | -0.228 |
| 3.936415594947905 | 0.259 | -0.157 | -0.23 |
| 3.939557187601495 | 0.252 | -0.16 | -0.231 |
| 3.942698780255084 | 0.245 | -0.162 | -0.233 |
| 3.945840372908674 | 0.237 | -0.165 | -0.235 |
| 3.948981965562263 | 0.23 | -0.168 | -0.236 |
| 3.952123558215853 | 0.223 | -0.17 | -0.238 |
| 3.955265150869442 | 0.216 | -0.173 | -0.24 |
| 3.958406743523032 | 0.21 | -0.176 | -0.241 |
| 3.961548336176622 | 0.203 | -0.178 | -0.243 |
| 3.964689928830211 | 0.196 | -0.181 | -0.245 |
| 3.967831521483801 | 0.189 | -0.184 | -0.246 |
| 3.97097311413739 | 0.183 | -0.186 | -0.248 |
| 3.97411470679098 | 0.176 | -0.189 | -0.249 |
| 3.97725629944457 | 0.169 | -0.191 | -0.251 |
| 3.98039789209816 | 0.163 | -0.194 | -0.253 |
| 3.983539484751749 | 0.157 | -0.197 | -0.254 |
| 3.986681077405338 | 0.15 | -0.199 | -0.256 |
| 3.989822670058928 | 0.144 | -0.202 | -0.257 |
| 3.992964262712517 | 0.138 | -0.204 | -0.259 |
| 3.996105855366107 | 0.131 | -0.207 | -0.261 |
| 3.999247448019697 | 0.125 | -0.209 | -0.262 |
| 4.002389040673287 | 0.119 | -0.212 | -0.264 |
| 4.005530633326877 | 0.113 | -0.214 | -0.265 |
| 4.008672225980466 | 0.107 | -0.216 | -0.267 |
| 4.011813818634056 | 0.101 | -0.219 | -0.268 |
| 4.014955411287645 | 0.095 | -0.221 | -0.27 |
| 4.018097003941234 | 0.089 | -0.224 | -0.271 |
| 4.021238596594824 | 0.084 | -0.226 | -0.273 |
| 4.024380189248414 | 0.078 | -0.229 | -0.274 |
| 4.027521781902004 | 0.072 | -0.231 | -0.276 |
| 4.030663374555593 | 0.066 | -0.233 | -0.277 |
| 4.033804967209183 | 0.061 | -0.236 | -0.279 |
| 4.036946559862773 | 0.055 | -0.238 | -0.28 |
| 4.040088152516362 | 0.049 | -0.24 | -0.282 |
| 4.043229745169951 | 0.044 | -0.243 | -0.283 |
| 4.046371337823541 | 0.038 | -0.245 | -0.285 |
| 4.049512930477131 | 0.033 | -0.247 | -0.286 |
| 4.05265452313072 | 0.028 | -0.25 | -0.288 |
| 4.05579611578431 | 0.022 | -0.252 | -0.289 |
| 4.0589377084379 | 0.017 | -0.254 | -0.291 |
| 4.062079301091489 | 0.011 | -0.256 | -0.292 |
| 4.065220893745079 | 0.006 | -0.259 | -0.293 |
| 4.068362486398668 | 0.001 | -0.261 | -0.295 |
| 4.071504079052258 | -0.004 | -0.263 | -0.296 |
| 4.074645671705848 | -0.01 | -0.265 | -0.298 |
| 4.077787264359437 | -0.015 | -0.268 | -0.299 |
| 4.080928857013027 | -0.02 | -0.27 | -0.301 |
| 4.084070449666616 | -0.025 | -0.272 | -0.302 |
| 4.087212042320206 | -0.03 | -0.274 | -0.303 |
| 4.090353634973795 | -0.035 | -0.276 | -0.305 |
| 4.093495227627385 | -0.04 | -0.279 | -0.306 |
| 4.096636820280975 | -0.045 | -0.281 | -0.308 |
| 4.099778412934564 | -0.05 | -0.283 | -0.309 |
| 4.102920005588154 | -0.055 | -0.285 | -0.31 |
| 4.106061598241744 | -0.06 | -0.287 | -0.312 |
| 4.109203190895333 | -0.065 | -0.289 | -0.313 |
| 4.112344783548923 | -0.07 | -0.291 | -0.314 |
| 4.115486376202512 | -0.074 | -0.294 | -0.316 |
| 4.118627968856102 | -0.079 | -0.296 | -0.317 |
| 4.121769561509692 | -0.084 | -0.298 | -0.318 |
| 4.124911154163281 | -0.089 | -0.3 | -0.32 |
| 4.128052746816871 | -0.093 | -0.302 | -0.321 |
| 4.13119433947046 | -0.098 | -0.304 | -0.323 |
| 4.13433593212405 | -0.103 | -0.306 | -0.324 |
| 4.13747752477764 | -0.107 | -0.308 | -0.325 |
| 4.14061911743123 | -0.112 | -0.31 | -0.327 |
| 4.143760710084818 | -0.117 | -0.312 | -0.328 |
| 4.146902302738408 | -0.121 | -0.314 | -0.329 |
| 4.150043895391998 | -0.126 | -0.317 | -0.33 |
| 4.153185488045588 | -0.13 | -0.319 | -0.332 |
| 4.156327080699177 | -0.135 | -0.321 | -0.333 |
| 4.159468673352766 | -0.139 | -0.323 | -0.334 |
| 4.162610266006356 | -0.144 | -0.325 | -0.336 |
| 4.165751858659946 | -0.148 | -0.327 | -0.337 |
| 4.168893451313535 | -0.153 | -0.329 | -0.338 |
| 4.172035043967125 | -0.157 | -0.331 | -0.34 |
| 4.175176636620715 | -0.161 | -0.333 | -0.341 |
| 4.178318229274304 | -0.166 | -0.335 | -0.342 |
| 4.181459821927894 | -0.17 | -0.337 | -0.343 |
| 4.184601414581484 | -0.174 | -0.339 | -0.345 |
| 4.187743007235073 | -0.179 | -0.341 | -0.346 |
| 4.190884599888663 | -0.183 | -0.343 | -0.347 |
| 4.194026192542252 | -0.187 | -0.344 | -0.349 |
| 4.197167785195842 | -0.191 | -0.346 | -0.35 |
| 4.200309377849432 | -0.196 | -0.348 | -0.351 |
| 4.203450970503021 | -0.2 | -0.35 | -0.352 |
| 4.206592563156611 | -0.204 | -0.352 | -0.354 |
| 4.2097341558102 | -0.208 | -0.354 | -0.355 |
| 4.21287574846379 | -0.212 | -0.356 | -0.356 |
| 4.21601734111738 | -0.217 | -0.358 | -0.357 |
| 4.21915893377097 | -0.221 | -0.36 | -0.359 |
| 4.222300526424559 | -0.225 | -0.362 | -0.36 |
| 4.225442119078148 | -0.229 | -0.364 | -0.361 |
| 4.228583711731738 | -0.233 | -0.366 | -0.362 |
| 4.231725304385327 | -0.237 | -0.368 | -0.364 |
| 4.234866897038917 | -0.241 | -0.369 | -0.365 |
| 4.238008489692506 | -0.245 | -0.371 | -0.366 |
| 4.241150082346096 | -0.249 | -0.373 | -0.367 |
| 4.244291674999685 | -0.253 | -0.375 | -0.369 |
| 4.247433267653276 | -0.257 | -0.377 | -0.37 |
| 4.250574860306865 | -0.261 | -0.379 | -0.371 |
| 4.253716452960455 | -0.265 | -0.381 | -0.372 |
| 4.256858045614044 | -0.269 | -0.383 | -0.373 |
| 4.259999638267634 | -0.273 | -0.384 | -0.375 |
| 4.263141230921224 | -0.277 | -0.386 | -0.376 |
| 4.266282823574813 | -0.281 | -0.388 | -0.377 |
| 4.269424416228403 | -0.285 | -0.39 | -0.378 |
| 4.272566008881992 | -0.289 | -0.392 | -0.379 |
| 4.275707601535582 | -0.293 | -0.394 | -0.381 |
| 4.27884919418917 | -0.296 | -0.395 | -0.382 |
| 4.28199078684276 | -0.3 | -0.397 | -0.383 |
| 4.285132379496351 | -0.304 | -0.399 | -0.384 |
| 4.28827397214994 | -0.308 | -0.401 | -0.385 |
| 4.29141556480353 | -0.312 | -0.403 | -0.387 |
| 4.294557157457119 | -0.316 | -0.404 | -0.388 |
| 4.29769875011071 | -0.319 | -0.406 | -0.389 |
| 4.300840342764299 | -0.323 | -0.408 | -0.39 |
| 4.303981935417888 | -0.327 | -0.41 | -0.391 |
| 4.307123528071478 | -0.331 | -0.412 | -0.392 |
| 4.310265120725067 | -0.334 | -0.413 | -0.394 |
| 4.313406713378657 | -0.338 | -0.415 | -0.395 |
| 4.316548306032247 | -0.342 | -0.417 | -0.396 |
| 4.319689898685836 | -0.346 | -0.419 | -0.397 |
| 4.322831491339426 | -0.349 | -0.421 | -0.398 |
| 4.325973083993015 | -0.353 | -0.422 | -0.399 |
| 4.329114676646605 | -0.357 | -0.424 | -0.401 |
| 4.332256269300195 | -0.36 | -0.426 | -0.402 |
| 4.335397861953784 | -0.364 | -0.428 | -0.403 |
| 4.338539454607374 | -0.368 | -0.429 | -0.404 |
| 4.341681047260963 | -0.371 | -0.431 | -0.405 |
| 4.344822639914553 | -0.375 | -0.433 | -0.406 |
| 4.347964232568143 | -0.378 | -0.435 | -0.408 |
| 4.351105825221732 | -0.382 | -0.436 | -0.409 |
| 4.354247417875322 | -0.386 | -0.438 | -0.41 |
| 4.357389010528911 | -0.389 | -0.44 | -0.411 |
| 4.360530603182501 | -0.393 | -0.442 | -0.412 |
| 4.36367219583609 | -0.396 | -0.443 | -0.413 |
| 4.36681378848968 | -0.4 | -0.445 | -0.414 |
| 4.36995538114327 | -0.404 | -0.447 | -0.416 |
| 4.373096973796859 | -0.407 | -0.448 | -0.417 |
| 4.376238566450449 | -0.411 | -0.45 | -0.418 |
| 4.379380159104038 | -0.414 | -0.452 | -0.419 |
| 4.382521751757628 | -0.418 | -0.454 | -0.42 |
| 4.385663344411217 | -0.421 | -0.455 | -0.421 |
| 4.388804937064807 | -0.425 | -0.457 | -0.422 |
| 4.391946529718397 | -0.428 | -0.459 | -0.423 |
| 4.395088122371987 | -0.432 | -0.46 | -0.425 |
| 4.398229715025576 | -0.435 | -0.462 | -0.426 |
| 4.401371307679165 | -0.439 | -0.464 | -0.427 |
| 4.404512900332755 | -0.442 | -0.465 | -0.428 |
| 4.407654492986345 | -0.446 | -0.467 | -0.429 |
| 4.410796085639934 | -0.449 | -0.469 | -0.43 |
| 4.413937678293524 | -0.453 | -0.471 | -0.431 |
| 4.417079270947114 | -0.456 | -0.472 | -0.432 |
| 4.420220863600703 | -0.459 | -0.474 | -0.433 |
| 4.423362456254293 | -0.463 | -0.476 | -0.435 |
| 4.426504048907883 | -0.466 | -0.477 | -0.436 |
| 4.429645641561472 | -0.47 | -0.479 | -0.437 |
| 4.432787234215062 | -0.473 | -0.481 | -0.438 |
| 4.435928826868651 | -0.477 | -0.482 | -0.439 |
| 4.43907041952224 | -0.48 | -0.484 | -0.44 |
| 4.44221201217583 | -0.483 | -0.486 | -0.441 |
| 4.44535360482942 | -0.487 | -0.487 | -0.442 |
| 4.44849519748301 | -0.49 | -0.489 | -0.443 |
| 4.4516367901366 | -0.493 | -0.491 | -0.445 |
| 4.454778382790188 | -0.497 | -0.492 | -0.446 |
| 4.457919975443779 | -0.5 | -0.494 | -0.447 |
| 4.461061568097368 | -0.504 | -0.496 | -0.448 |
| 4.464203160750958 | -0.507 | -0.497 | -0.449 |
| 4.467344753404547 | -0.51 | -0.499 | -0.45 |
| 4.470486346058137 | -0.514 | -0.5 | -0.451 |
| 4.473627938711726 | -0.517 | -0.502 | -0.452 |
| 4.476769531365316 | -0.52 | -0.504 | -0.453 |
| 4.479911124018905 | -0.524 | -0.505 | -0.454 |
| 4.483052716672495 | -0.527 | -0.507 | -0.455 |
| 4.486194309326085 | -0.53 | -0.509 | -0.457 |
| 4.489335901979674 | -0.533 | -0.51 | -0.458 |
| 4.492477494633264 | -0.537 | -0.512 | -0.459 |
| 4.495619087286854 | -0.54 | -0.514 | -0.46 |
| 4.498760679940443 | -0.543 | -0.515 | -0.461 |
| 4.501902272594033 | -0.547 | -0.517 | -0.462 |
| 4.505043865247622 | -0.55 | -0.518 | -0.463 |
| 4.508185457901212 | -0.553 | -0.52 | -0.464 |
| 4.511327050554801 | -0.557 | -0.522 | -0.465 |
| 4.514468643208391 | -0.56 | -0.523 | -0.466 |
| 4.517610235861981 | -0.563 | -0.525 | -0.467 |
| 4.520751828515571 | -0.566 | -0.527 | -0.468 |
| 4.52389342116916 | -0.57 | -0.528 | -0.469 |
| 4.52703501382275 | -0.573 | -0.53 | -0.471 |
| 4.530176606476339 | -0.576 | -0.531 | -0.472 |
| 4.533318199129928 | -0.579 | -0.533 | -0.473 |
| 4.536459791783518 | -0.583 | -0.535 | -0.474 |
| 4.539601384437108 | -0.586 | -0.536 | -0.475 |
| 4.542742977090698 | -0.589 | -0.538 | -0.476 |
| 4.545884569744287 | -0.592 | -0.539 | -0.477 |
| 4.549026162397876 | -0.596 | -0.541 | -0.478 |
| 4.552167755051466 | -0.599 | -0.543 | -0.479 |
| 4.555309347705056 | -0.602 | -0.544 | -0.48 |
| 4.558450940358646 | -0.605 | -0.546 | -0.481 |
| 4.561592533012235 | -0.608 | -0.547 | -0.482 |
| 4.564734125665825 | -0.612 | -0.549 | -0.483 |
| 4.567875718319415 | -0.615 | -0.551 | -0.484 |
| 4.571017310973004 | -0.618 | -0.552 | -0.485 |
| 4.574158903626594 | -0.621 | -0.554 | -0.487 |
| 4.577300496280183 | -0.624 | -0.555 | -0.488 |
| 4.580442088933772 | -0.628 | -0.557 | -0.489 |
| 4.583583681587362 | -0.631 | -0.559 | -0.49 |
| 4.586725274240952 | -0.634 | -0.56 | -0.491 |
| 4.589866866894542 | -0.637 | -0.562 | -0.492 |
| 4.593008459548131 | -0.64 | -0.563 | -0.493 |
| 4.596150052201721 | -0.644 | -0.565 | -0.494 |
| 4.59929164485531 | -0.647 | -0.566 | -0.495 |
| 4.6024332375089 | -0.65 | -0.568 | -0.496 |
| 4.60557483016249 | -0.653 | -0.57 | -0.497 |
| 4.608716422816079 | -0.656 | -0.571 | -0.498 |
| 4.611858015469668 | -0.659 | -0.573 | -0.499 |
| 4.614999608123258 | -0.663 | -0.574 | -0.5 |
| 4.618141200776848 | -0.666 | -0.576 | -0.501 |
| 4.621282793430437 | -0.669 | -0.578 | -0.502 |
| 4.624424386084027 | -0.672 | -0.579 | -0.503 |
| 4.627565978737617 | -0.675 | -0.581 | -0.504 |
| 4.630707571391206 | -0.678 | -0.582 | -0.506 |
| 4.633849164044795 | -0.682 | -0.584 | -0.507 |
| 4.636990756698386 | -0.685 | -0.585 | -0.508 |
| 4.640132349351975 | -0.688 | -0.587 | -0.509 |
| 4.643273942005564 | -0.691 | -0.589 | -0.51 |
| 4.646415534659154 | -0.694 | -0.59 | -0.511 |
| 4.649557127312744 | -0.697 | -0.592 | -0.512 |
| 4.652698719966334 | -0.701 | -0.593 | -0.513 |
| 4.655840312619923 | -0.704 | -0.595 | -0.514 |
| 4.658981905273513 | -0.707 | -0.597 | -0.515 |
| 4.662123497927102 | -0.71 | -0.598 | -0.516 |
| 4.665265090580692 | -0.713 | -0.6 | -0.517 |
| 4.668406683234282 | -0.716 | -0.601 | -0.518 |
| 4.671548275887871 | -0.719 | -0.603 | -0.519 |
| 4.674689868541461 | -0.723 | -0.604 | -0.52 |
| 4.67783146119505 | -0.726 | -0.606 | -0.521 |
| 4.68097305384864 | -0.729 | -0.608 | -0.522 |
| 4.68411464650223 | -0.732 | -0.609 | -0.523 |
| 4.687256239155819 | -0.735 | -0.611 | -0.524 |
| 4.690397831809409 | -0.738 | -0.612 | -0.525 |
| 4.693539424462998 | -0.741 | -0.614 | -0.526 |
| 4.696681017116588 | -0.745 | -0.615 | -0.528 |
| 4.699822609770177 | -0.748 | -0.617 | -0.529 |
| 4.702964202423767 | -0.751 | -0.619 | -0.53 |
| 4.706105795077356 | -0.754 | -0.62 | -0.531 |
| 4.709247387730946 | -0.757 | -0.622 | -0.532 |
| 4.712388980384535 | -0.76 | -0.623 | -0.533 |
| 4.715530573038126 | -0.763 | -0.625 | -0.534 |
| 4.718672165691715 | -0.767 | -0.626 | -0.535 |
| 4.721813758345305 | -0.77 | -0.628 | -0.536 |
| 4.724955350998894 | -0.773 | -0.63 | -0.537 |
| 4.728096943652484 | -0.776 | -0.631 | -0.538 |
| 4.731238536306074 | -0.779 | -0.633 | -0.539 |
| 4.734380128959663 | -0.782 | -0.634 | -0.54 |
| 4.737521721613253 | -0.785 | -0.636 | -0.541 |
| 4.740663314266842 | -0.789 | -0.637 | -0.542 |
| 4.743804906920432 | -0.792 | -0.639 | -0.543 |
| 4.74694649957402 | -0.795 | -0.641 | -0.544 |
| 4.750088092227611 | -0.798 | -0.642 | -0.545 |
| 4.7532296848812 | -0.801 | -0.644 | -0.546 |
| 4.75637127753479 | -0.804 | -0.645 | -0.547 |
| 4.75951287018838 | -0.808 | -0.647 | -0.548 |
| 4.76265446284197 | -0.811 | -0.648 | -0.55 |
| 4.765796055495559 | -0.814 | -0.65 | -0.551 |
| 4.768937648149149 | -0.817 | -0.652 | -0.552 |
| 4.772079240802738 | -0.82 | -0.653 | -0.553 |
| 4.775220833456327 | -0.823 | -0.655 | -0.554 |
| 4.778362426109917 | -0.826 | -0.656 | -0.555 |
| 4.781504018763507 | -0.83 | -0.658 | -0.556 |
| 4.784645611417097 | -0.833 | -0.659 | -0.557 |
| 4.787787204070686 | -0.836 | -0.661 | -0.558 |
| 4.790928796724275 | -0.839 | -0.663 | -0.559 |
| 4.794070389377865 | -0.842 | -0.664 | -0.56 |
| 4.797211982031455 | -0.845 | -0.666 | -0.561 |
| 4.800353574685045 | -0.849 | -0.667 | -0.562 |
| 4.803495167338634 | -0.852 | -0.669 | -0.563 |
| 4.806636759992224 | -0.855 | -0.67 | -0.564 |
| 4.809778352645814 | -0.858 | -0.672 | -0.565 |
| 4.812919945299403 | -0.861 | -0.674 | -0.566 |
| 4.816061537952993 | -0.864 | -0.675 | -0.567 |
| 4.819203130606582 | -0.868 | -0.677 | -0.568 |
| 4.822344723260172 | -0.871 | -0.678 | -0.57 |
| 4.825486315913761 | -0.874 | -0.68 | -0.571 |
| 4.828627908567351 | -0.877 | -0.682 | -0.572 |
| 4.83176950122094 | -0.88 | -0.683 | -0.573 |
| 4.83491109387453 | -0.883 | -0.685 | -0.574 |
| 4.83805268652812 | -0.887 | -0.686 | -0.575 |
| 4.841194279181709 | -0.89 | -0.688 | -0.576 |
| 4.844335871835299 | -0.893 | -0.689 | -0.577 |
| 4.847477464488889 | -0.896 | -0.691 | -0.578 |
| 4.850619057142478 | -0.899 | -0.693 | -0.579 |
| 4.853760649796068 | -0.903 | -0.694 | -0.58 |
| 4.856902242449657 | -0.906 | -0.696 | -0.581 |
| 4.860043835103247 | -0.909 | -0.697 | -0.582 |
| 4.863185427756837 | -0.912 | -0.699 | -0.583 |
| 4.866327020410426 | -0.916 | -0.701 | -0.584 |
| 4.869468613064015 | -0.919 | -0.702 | -0.585 |
| 4.872610205717605 | -0.922 | -0.704 | -0.586 |
| 4.875751798371195 | -0.925 | -0.705 | -0.588 |
| 4.878893391024784 | -0.928 | -0.707 | -0.589 |
| 4.882034983678374 | -0.932 | -0.709 | -0.59 |
| 4.885176576331964 | -0.935 | -0.71 | -0.591 |
| 4.888318168985553 | -0.938 | -0.712 | -0.592 |
| 4.891459761639143 | -0.941 | -0.713 | -0.593 |
| 4.894601354292733 | -0.945 | -0.715 | -0.594 |
| 4.897742946946322 | -0.948 | -0.717 | -0.595 |
| 4.900884539599912 | -0.951 | -0.718 | -0.596 |
| 4.904026132253501 | -0.954 | -0.72 | -0.597 |
| 4.907167724907091 | -0.958 | -0.722 | -0.598 |
| 4.91030931756068 | -0.961 | -0.723 | -0.599 |
| 4.91345091021427 | -0.964 | -0.725 | -0.6 |
| 4.91659250286786 | -0.967 | -0.726 | -0.601 |
| 4.91973409552145 | -0.971 | -0.728 | -0.603 |
| 4.922875688175039 | -0.974 | -0.73 | -0.604 |
| 4.926017280828628 | -0.977 | -0.731 | -0.605 |
| 4.929158873482218 | -0.981 | -0.733 | -0.606 |
| 4.932300466135808 | -0.984 | -0.735 | -0.607 |
| 4.935442058789397 | -0.987 | -0.736 | -0.608 |
| 4.938583651442987 | -0.991 | -0.738 | -0.609 |
| 4.941725244096576 | -0.994 | -0.739 | -0.61 |
| 4.944866836750166 | -0.997 | -0.741 | -0.611 |
| 4.948008429403755 | -1 | -0.743 | -0.612 |
| 4.951150022057345 | -1.004 | -0.744 | -0.613 |
| 4.954291614710935 | -1.007 | -0.746 | -0.614 |
| 4.957433207364524 | -1.01 | -0.748 | -0.616 |
| 4.960574800018114 | -1.014 | -0.749 | -0.617 |
| 4.963716392671704 | -1.017 | -0.751 | -0.618 |
| 4.966857985325293 | -1.021 | -0.753 | -0.619 |
| 4.969999577978883 | -1.024 | -0.754 | -0.62 |
| 4.973141170632472 | -1.027 | -0.756 | -0.621 |
| 4.976282763286062 | -1.031 | -0.758 | -0.622 |
| 4.979424355939651 | -1.034 | -0.759 | -0.623 |
| 4.982565948593241 | -1.037 | -0.761 | -0.624 |
| 4.985707541246831 | -1.041 | -0.763 | -0.625 |
| 4.98884913390042 | -1.044 | -0.764 | -0.627 |
| 4.99199072655401 | -1.048 | -0.766 | -0.628 |
| 4.9951323192076 | -1.051 | -0.768 | -0.629 |
| 4.99827391186119 | -1.054 | -0.769 | -0.63 |
| 5.00141550451478 | -1.058 | -0.771 | -0.631 |
| 5.004557097168369 | -1.061 | -0.773 | -0.632 |
| 5.007698689821958 | -1.065 | -0.774 | -0.633 |
| 5.010840282475548 | -1.068 | -0.776 | -0.634 |
| 5.013981875129137 | -1.072 | -0.778 | -0.635 |
| 5.017123467782727 | -1.075 | -0.779 | -0.637 |
| 5.020265060436317 | -1.078 | -0.781 | -0.638 |
| 5.023406653089906 | -1.082 | -0.783 | -0.639 |
| 5.026548245743496 | -1.085 | -0.784 | -0.64 |
| 5.029689838397085 | -1.089 | -0.786 | -0.641 |
| 5.032831431050674 | -1.092 | -0.788 | -0.642 |
| 5.035973023704264 | -1.096 | -0.789 | -0.643 |
| 5.039114616357854 | -1.099 | -0.791 | -0.644 |
| 5.042256209011444 | -1.103 | -0.793 | -0.645 |
| 5.045397801665033 | -1.106 | -0.795 | -0.647 |
| 5.048539394318622 | -1.11 | -0.796 | -0.648 |
| 5.051680986972213 | -1.114 | -0.798 | -0.649 |
| 5.054822579625802 | -1.117 | -0.8 | -0.65 |
| 5.057964172279392 | -1.121 | -0.801 | -0.651 |
| 5.061105764932981 | -1.124 | -0.803 | -0.652 |
| 5.064247357586571 | -1.128 | -0.805 | -0.653 |
| 5.067388950240161 | -1.131 | -0.807 | -0.655 |
| 5.07053054289375 | -1.135 | -0.808 | -0.656 |
| 5.07367213554734 | -1.139 | -0.81 | -0.657 |
| 5.07681372820093 | -1.142 | -0.812 | -0.658 |
| 5.079955320854519 | -1.146 | -0.814 | -0.659 |
| 5.083096913508108 | -1.149 | -0.815 | -0.66 |
| 5.086238506161698 | -1.153 | -0.817 | -0.661 |
| 5.089380098815288 | -1.157 | -0.819 | -0.663 |
| 5.092521691468877 | -1.16 | -0.821 | -0.664 |
| 5.095663284122466 | -1.164 | -0.822 | -0.665 |
| 5.098804876776057 | -1.168 | -0.824 | -0.666 |
| 5.101946469429646 | -1.171 | -0.826 | -0.667 |
| 5.105088062083236 | -1.175 | -0.828 | -0.668 |
| 5.108229654736825 | -1.179 | -0.829 | -0.67 |
| 5.111371247390415 | -1.183 | -0.831 | -0.671 |
| 5.114512840044005 | -1.186 | -0.833 | -0.672 |
| 5.117654432697594 | -1.19 | -0.835 | -0.673 |
| 5.120796025351184 | -1.194 | -0.837 | -0.674 |
| 5.123937618004773 | -1.198 | -0.838 | -0.675 |
| 5.127079210658363 | -1.201 | -0.84 | -0.677 |
| 5.130220803311953 | -1.205 | -0.842 | -0.678 |
| 5.133362395965542 | -1.209 | -0.844 | -0.679 |
| 5.136503988619131 | -1.213 | -0.846 | -0.68 |
| 5.13964558127272 | -1.217 | -0.847 | -0.681 |
| 5.142787173926311 | -1.22 | -0.849 | -0.683 |
| 5.1459287665799 | -1.224 | -0.851 | -0.684 |
| 5.14907035923349 | -1.228 | -0.853 | -0.685 |
| 5.15221195188708 | -1.232 | -0.855 | -0.686 |
| 5.15535354454067 | -1.236 | -0.857 | -0.687 |
| 5.158495137194259 | -1.24 | -0.858 | -0.689 |
| 5.161636729847848 | -1.244 | -0.86 | -0.69 |
| 5.164778322501438 | -1.248 | -0.862 | -0.691 |
| 5.167919915155028 | -1.252 | -0.864 | -0.692 |
| 5.171061507808617 | -1.256 | -0.866 | -0.693 |
| 5.174203100462206 | -1.259 | -0.868 | -0.695 |
| 5.177344693115796 | -1.263 | -0.869 | -0.696 |
| 5.180486285769386 | -1.267 | -0.871 | -0.697 |
| 5.183627878422976 | -1.271 | -0.873 | -0.698 |
| 5.186769471076565 | -1.275 | -0.875 | -0.699 |
| 5.189911063730155 | -1.28 | -0.877 | -0.701 |
| 5.193052656383744 | -1.284 | -0.879 | -0.702 |
| 5.196194249037334 | -1.288 | -0.881 | -0.703 |
| 5.199335841690924 | -1.292 | -0.883 | -0.704 |
| 5.202477434344513 | -1.296 | -0.885 | -0.706 |
| 5.205619026998103 | -1.3 | -0.886 | -0.707 |
| 5.208760619651692 | -1.304 | -0.888 | -0.708 |
| 5.211902212305282 | -1.308 | -0.89 | -0.709 |
| 5.215043804958871 | -1.312 | -0.892 | -0.711 |
| 5.218185397612461 | -1.317 | -0.894 | -0.712 |
| 5.221326990266051 | -1.321 | -0.896 | -0.713 |
| 5.22446858291964 | -1.325 | -0.898 | -0.714 |
| 5.22761017557323 | -1.329 | -0.9 | -0.716 |
| 5.23075176822682 | -1.333 | -0.902 | -0.717 |
| 5.23389336088041 | -1.338 | -0.904 | -0.718 |
| 5.237034953533999 | -1.342 | -0.906 | -0.72 |
| 5.240176546187588 | -1.346 | -0.908 | -0.721 |
| 5.243318138841178 | -1.351 | -0.91 | -0.722 |
| 5.246459731494767 | -1.355 | -0.912 | -0.723 |
| 5.249601324148357 | -1.359 | -0.914 | -0.725 |
| 5.252742916801947 | -1.364 | -0.916 | -0.726 |
| 5.255884509455536 | -1.368 | -0.918 | -0.727 |
| 5.259026102109125 | -1.373 | -0.92 | -0.729 |
| 5.262167694762715 | -1.377 | -0.922 | -0.73 |
| 5.265309287416305 | -1.382 | -0.924 | -0.731 |
| 5.268450880069895 | -1.386 | -0.926 | -0.732 |
| 5.271592472723484 | -1.39 | -0.928 | -0.734 |
| 5.274734065377074 | -1.395 | -0.93 | -0.735 |
| 5.277875658030664 | -1.4 | -0.932 | -0.736 |
| 5.281017250684253 | -1.404 | -0.934 | -0.738 |
| 5.284158843337843 | -1.409 | -0.936 | -0.739 |
| 5.287300435991432 | -1.413 | -0.938 | -0.74 |
| 5.290442028645022 | -1.418 | -0.94 | -0.742 |
| 5.293583621298612 | -1.423 | -0.942 | -0.743 |
| 5.296725213952201 | -1.427 | -0.944 | -0.744 |
| 5.299866806605791 | -1.432 | -0.947 | -0.746 |
| 5.30300839925938 | -1.437 | -0.949 | -0.747 |
| 5.30614999191297 | -1.442 | -0.951 | -0.748 |
| 5.30929158456656 | -1.446 | -0.953 | -0.75 |
| 5.312433177220149 | -1.451 | -0.955 | -0.751 |
| 5.315574769873739 | -1.456 | -0.957 | -0.753 |
| 5.318716362527328 | -1.461 | -0.959 | -0.754 |
| 5.321857955180918 | -1.466 | -0.961 | -0.755 |
| 5.324999547834508 | -1.471 | -0.964 | -0.757 |
| 5.328141140488097 | -1.476 | -0.966 | -0.758 |
| 5.331282733141686 | -1.481 | -0.968 | -0.759 |
| 5.334424325795276 | -1.486 | -0.97 | -0.761 |
| 5.337565918448866 | -1.491 | -0.972 | -0.762 |
| 5.340707511102456 | -1.496 | -0.974 | -0.764 |
| 5.343849103756045 | -1.501 | -0.977 | -0.765 |
| 5.346990696409634 | -1.506 | -0.979 | -0.766 |
| 5.350132289063224 | -1.511 | -0.981 | -0.768 |
| 5.353273881716814 | -1.516 | -0.983 | -0.769 |
| 5.356415474370403 | -1.522 | -0.986 | -0.771 |
| 5.359557067023993 | -1.527 | -0.988 | -0.772 |
| 5.362698659677583 | -1.532 | -0.99 | -0.774 |
| 5.365840252331172 | -1.537 | -0.992 | -0.775 |
| 5.368981844984762 | -1.543 | -0.995 | -0.776 |
| 5.372123437638351 | -1.548 | -0.997 | -0.778 |
| 5.375265030291941 | -1.554 | -0.999 | -0.779 |
| 5.378406622945531 | -1.559 | -1.001 | -0.781 |
| 5.38154821559912 | -1.565 | -1.004 | -0.782 |
| 5.38468980825271 | -1.57 | -1.006 | -0.784 |
| 5.387831400906299 | -1.576 | -1.008 | -0.785 |
| 5.39097299355989 | -1.581 | -1.011 | -0.787 |
| 5.394114586213479 | -1.587 | -1.013 | -0.788 |
| 5.397256178867068 | -1.593 | -1.016 | -0.79 |
| 5.400397771520657 | -1.598 | -1.018 | -0.791 |
| 5.403539364174247 | -1.604 | -1.02 | -0.793 |
| 5.406680956827837 | -1.61 | -1.023 | -0.794 |
| 5.409822549481426 | -1.616 | -1.025 | -0.796 |
| 5.412964142135016 | -1.622 | -1.028 | -0.797 |
| 5.416105734788605 | -1.628 | -1.03 | -0.799 |
| 5.419247327442195 | -1.634 | -1.032 | -0.8 |
| 5.422388920095785 | -1.64 | -1.035 | -0.802 |
| 5.425530512749375 | -1.646 | -1.037 | -0.803 |
| 5.428672105402964 | -1.652 | -1.04 | -0.805 |
| 5.431813698056554 | -1.658 | -1.042 | -0.807 |
| 5.434955290710143 | -1.665 | -1.045 | -0.808 |
| 5.438096883363733 | -1.671 | -1.047 | -0.81 |
| 5.441238476017322 | -1.677 | -1.05 | -0.811 |
| 5.444380068670912 | -1.684 | -1.052 | -0.813 |
| 5.447521661324502 | -1.69 | -1.055 | -0.814 |
| 5.450663253978091 | -1.697 | -1.058 | -0.816 |
| 5.453804846631681 | -1.703 | -1.06 | -0.818 |
| 5.456946439285271 | -1.71 | -1.063 | -0.819 |
| 5.46008803193886 | -1.717 | -1.065 | -0.821 |
| 5.46322962459245 | -1.723 | -1.068 | -0.823 |
| 5.466371217246039 | -1.73 | -1.071 | -0.824 |
| 5.46951280989963 | -1.737 | -1.073 | -0.826 |
| 5.472654402553218 | -1.744 | -1.076 | -0.827 |
| 5.475795995206808 | -1.751 | -1.079 | -0.829 |
| 5.478937587860398 | -1.758 | -1.081 | -0.831 |
| 5.482079180513987 | -1.765 | -1.084 | -0.832 |
| 5.485220773167577 | -1.773 | -1.087 | -0.834 |
| 5.488362365821166 | -1.78 | -1.09 | -0.836 |
| 5.491503958474756 | -1.787 | -1.092 | -0.838 |
| 5.494645551128346 | -1.795 | -1.095 | -0.839 |
| 5.497787143781935 | -1.802 | -1.098 | -0.841 |
| 5.500928736435525 | -1.81 | -1.101 | -0.843 |
| 5.504070329089115 | -1.818 | -1.103 | -0.844 |
| 5.507211921742704 | -1.825 | -1.106 | -0.846 |
| 5.510353514396294 | -1.833 | -1.109 | -0.848 |
| 5.513495107049883 | -1.841 | -1.112 | -0.85 |
| 5.516636699703473 | -1.849 | -1.115 | -0.851 |
| 5.519778292357062 | -1.857 | -1.118 | -0.853 |
| 5.522919885010652 | -1.866 | -1.121 | -0.855 |
| 5.526061477664242 | -1.874 | -1.124 | -0.857 |
| 5.529203070317831 | -1.883 | -1.127 | -0.859 |
| 5.532344662971421 | -1.891 | -1.13 | -0.86 |
| 5.535486255625011 | -1.9 | -1.133 | -0.862 |
| 5.5386278482786 | -1.909 | -1.136 | -0.864 |
| 5.54176944093219 | -1.917 | -1.139 | -0.866 |
| 5.544911033585779 | -1.927 | -1.142 | -0.868 |
| 5.54805262623937 | -1.936 | -1.145 | -0.87 |
| 5.551194218892959 | -1.945 | -1.148 | -0.871 |
| 5.554335811546548 | -1.954 | -1.151 | -0.873 |
| 5.557477404200137 | -1.964 | -1.154 | -0.875 |
| 5.560618996853727 | -1.974 | -1.158 | -0.877 |
| 5.563760589507317 | -1.983 | -1.161 | -0.879 |
| 5.566902182160906 | -1.993 | -1.164 | -0.881 |
| 5.570043774814496 | -2.003 | -1.167 | -0.883 |
| 5.573185367468086 | -2.014 | -1.171 | -0.885 |
| 5.576326960121675 | -2.024 | -1.174 | -0.887 |
| 5.579468552775264 | -2.035 | -1.177 | -0.889 |
| 5.582610145428854 | -2.045 | -1.181 | -0.891 |
| 5.585751738082444 | -2.056 | -1.184 | -0.893 |
| 5.588893330736034 | -2.068 | -1.187 | -0.895 |
| 5.592034923389623 | -2.079 | -1.191 | -0.897 |
| 5.595176516043213 | -2.09 | -1.194 | -0.899 |
| 5.598318108696803 | -2.102 | -1.198 | -0.901 |
| 5.601459701350392 | -2.114 | -1.201 | -0.903 |
| 5.604601294003982 | -2.126 | -1.205 | -0.905 |
| 5.607742886657571 | -2.139 | -1.208 | -0.907 |
| 5.610884479311161 | -2.151 | -1.212 | -0.909 |
| 5.61402607196475 | -2.164 | -1.216 | -0.911 |
| 5.61716766461834 | -2.177 | -1.219 | -0.913 |
| 5.62030925727193 | -2.191 | -1.223 | -0.916 |
| 5.623450849925519 | -2.205 | -1.227 | -0.918 |
| 5.626592442579109 | -2.219 | -1.23 | -0.92 |
| 5.629734035232698 | -2.233 | -1.234 | -0.922 |
| 5.632875627886288 | -2.248 | -1.238 | -0.924 |
| 5.636017220539878 | -2.263 | -1.242 | -0.927 |
| 5.639158813193467 | -2.278 | -1.246 | -0.929 |
| 5.642300405847057 | -2.294 | -1.25 | -0.931 |
| 5.645441998500646 | -2.311 | -1.254 | -0.933 |
| 5.648583591154236 | -2.327 | -1.258 | -0.936 |
| 5.651725183807825 | -2.344 | -1.262 | -0.938 |
| 5.654866776461415 | -2.362 | -1.266 | -0.94 |
| 5.658008369115005 | -2.38 | -1.27 | -0.943 |
| 5.661149961768594 | -2.399 | -1.274 | -0.945 |
| 5.664291554422184 | -2.418 | -1.278 | -0.947 |
| 5.667433147075774 | -2.438 | -1.283 | -0.95 |
| 5.670574739729363 | -2.459 | -1.287 | -0.952 |
| 5.673716332382953 | -2.48 | -1.291 | -0.954 |
| 5.676857925036542 | -2.502 | -1.296 | -0.957 |
| 5.679999517690132 | -2.525 | -1.3 | -0.959 |
| 5.683141110343721 | -2.549 | -1.305 | -0.962 |
| 5.686282702997311 | -2.574 | -1.309 | -0.964 |
| 5.689424295650901 | -2.599 | -1.314 | -0.967 |
| 5.69256588830449 | -2.626 | -1.319 | -0.969 |
| 5.69570748095808 | -2.655 | -1.323 | -0.972 |
| 5.69884907361167 | -2.684 | -1.328 | -0.975 |
| 5.701990666265259 | -2.716 | -1.333 | -0.977 |
| 5.705132258918849 | -2.749 | -1.338 | -0.98 |
| 5.708273851572438 | -2.783 | -1.343 | -0.983 |
| 5.711415444226028 | -2.82 | -1.348 | -0.985 |
| 5.714557036879618 | -2.86 | -1.353 | -0.988 |
| 5.717698629533207 | -2.902 | -1.358 | -0.991 |
| 5.720840222186797 | -2.948 | -1.363 | -0.993 |
| 5.723981814840386 | -2.997 | -1.368 | -0.996 |
| 5.727123407493976 | -3.051 | -1.374 | -0.999 |
| 5.730265000147565 | -3.11 | -1.379 | -1.002 |
| 5.733406592801155 | -3.176 | -1.385 | -1.005 |
| 5.736548185454744 | -3.251 | -1.39 | -1.008 |
| 5.739689778108334 | -3.336 | -1.396 | -1.011 |
| 5.742831370761924 | -3.435 | -1.402 | -1.013 |
| 5.745972963415514 | -3.556 | -1.407 | -1.016 |
| 5.749114556069103 | -3.708 | -1.413 | -1.019 |
| 5.752256148722693 | -3.914 | -1.419 | -1.023 |
| 5.755397741376282 | -4.238 | -1.425 | -1.026 |
| 5.758539334029872 | -5.039 | -1.432 | -1.029 |
| 5.761680926683462 | -4.639 | -1.438 | -1.032 |
| 5.764822519337051 | -4.111 | -1.444 | -1.035 |
| 5.767964111990641 | -3.84 | -1.451 | -1.038 |
| 5.77110570464423 | -3.657 | -1.457 | -1.042 |
| 5.77424729729782 | -3.518 | -1.464 | -1.045 |
| 5.77738888995141 | -3.406 | -1.471 | -1.048 |
| 5.780530482605 | -3.313 | -1.478 | -1.052 |
| 5.783672075258588 | -3.233 | -1.485 | -1.055 |
| 5.786813667912178 | -3.162 | -1.492 | -1.058 |
| 5.789955260565768 | -3.1 | -1.5 | -1.062 |
| 5.793096853219358 | -3.044 | -1.507 | -1.065 |
| 5.796238445872947 | -2.992 | -1.515 | -1.069 |
| 5.799380038526537 | -2.945 | -1.523 | -1.073 |
| 5.802521631180126 | -2.902 | -1.531 | -1.076 |
| 5.805663223833715 | -2.862 | -1.539 | -1.08 |
| 5.808804816487306 | -2.824 | -1.548 | -1.084 |
| 5.811946409140895 | -2.789 | -1.556 | -1.088 |
| 5.815088001794485 | -2.756 | -1.565 | -1.091 |
| 5.818229594448074 | -2.725 | -1.574 | -1.095 |
| 5.821371187101663 | -2.695 | -1.583 | -1.099 |
| 5.824512779755254 | -2.667 | -1.593 | -1.103 |
| 5.827654372408843 | -2.64 | -1.602 | -1.108 |
| 5.830795965062433 | -2.614 | -1.612 | -1.112 |
| 5.833937557716022 | -2.59 | -1.622 | -1.116 |
| 5.837079150369612 | -2.567 | -1.633 | -1.12 |
| 5.840220743023201 | -2.544 | -1.644 | -1.125 |
| 5.843362335676791 | -2.523 | -1.655 | -1.129 |
| 5.846503928330381 | -2.502 | -1.667 | -1.134 |
| 5.84964552098397 | -2.482 | -1.678 | -1.138 |
| 5.85278711363756 | -2.462 | -1.691 | -1.143 |
| 5.85592870629115 | -2.444 | -1.703 | -1.148 |
| 5.85907029894474 | -2.426 | -1.717 | -1.152 |
| 5.862211891598329 | -2.408 | -1.73 | -1.157 |
| 5.865353484251918 | -2.391 | -1.744 | -1.162 |
| 5.868495076905508 | -2.375 | -1.759 | -1.167 |
| 5.871636669559098 | -2.359 | -1.774 | -1.173 |
| 5.874778262212687 | -2.344 | -1.791 | -1.178 |
| 5.877919854866277 | -2.328 | -1.807 | -1.183 |
| 5.881061447519866 | -2.314 | -1.825 | -1.189 |
| 5.884203040173456 | -2.3 | -1.843 | -1.194 |
| 5.887344632827046 | -2.286 | -1.863 | -1.2 |
| 5.890486225480635 | -2.272 | -1.884 | -1.206 |
| 5.893627818134224 | -2.259 | -1.905 | -1.212 |
| 5.896769410787814 | -2.246 | -1.929 | -1.218 |
| 5.899911003441404 | -2.233 | -1.954 | -1.224 |
| 5.903052596094994 | -2.221 | -1.98 | -1.231 |
| 5.906194188748583 | -2.209 | -2.009 | -1.237 |
| 5.909335781402172 | -2.197 | -2.041 | -1.244 |
| 5.912477374055762 | -2.186 | -2.075 | -1.251 |
| 5.915618966709352 | -2.174 | -2.113 | -1.258 |
| 5.918760559362942 | -2.163 | -2.156 | -1.265 |
| 5.921902152016531 | -2.152 | -2.205 | -1.273 |
| 5.92504374467012 | -2.142 | -2.261 | -1.28 |
| 5.92818533732371 | -2.131 | -2.328 | -1.288 |
| 5.9313269299773 | -2.121 | -2.41 | -1.297 |
| 5.93446852263089 | -2.111 | -2.517 | -1.305 |
| 5.93761011528448 | -2.101 | -2.672 | -1.314 |
| 5.940751707938068 | -2.092 | -2.952 | -1.323 |
| 5.943893300591658 | -2.082 | -3.504 | -1.332 |
| 5.947034893245248 | -2.073 | -2.829 | -1.342 |
| 5.950176485898837 | -2.064 | -2.611 | -1.352 |
| 5.953318078552427 | -2.055 | -2.477 | -1.362 |
| 5.956459671206017 | -2.046 | -2.381 | -1.373 |
| 5.959601263859606 | -2.037 | -2.305 | -1.384 |
| 5.962742856513196 | -2.029 | -2.243 | -1.396 |
| 5.965884449166785 | -2.02 | -2.19 | -1.408 |
| 5.969026041820375 | -2.012 | -2.144 | -1.421 |
| 5.972167634473964 | -2.004 | -2.103 | -1.435 |
| 5.975309227127554 | -1.996 | -2.067 | -1.449 |
| 5.978450819781144 | -1.988 | -2.034 | -1.465 |
| 5.981592412434733 | -1.98 | -2.004 | -1.481 |
| 5.984734005088323 | -1.972 | -1.976 | -1.498 |
| 5.987875597741913 | -1.965 | -1.95 | -1.517 |
| 5.991017190395502 | -1.957 | -1.926 | -1.536 |
| 5.994158783049092 | -1.95 | -1.904 | -1.558 |
| 5.997300375702681 | -1.943 | -1.883 | -1.581 |
| 6.000441968356271 | -1.936 | -1.863 | -1.607 |
| 6.003583561009861 | -1.929 | -1.844 | -1.636 |
| 6.00672515366345 | -1.922 | -1.827 | -1.668 |
| 6.00986674631704 | -1.915 | -1.81 | -1.705 |
| 6.01300833897063 | -1.908 | -1.794 | -1.747 |
| 6.01614993162422 | -1.901 | -1.778 | -1.799 |
| 6.019291524277808 | -1.895 | -1.763 | -1.863 |
| 6.022433116931398 | -1.888 | -1.749 | -1.947 |
| 6.025574709584988 | -1.882 | -1.736 | -2.075 |
| 6.028716302238577 | -1.875 | -1.723 | -2.337 |
| 6.031857894892167 | -1.869 | -1.71 | -2.409 |
| 6.034999487545757 | -1.863 | -1.698 | -2.099 |
| 6.038141080199346 | -1.857 | -1.686 | -1.962 |
| 6.041282672852935 | -1.851 | -1.675 | -1.873 |
| 6.044424265506525 | -1.845 | -1.664 | -1.808 |
| 6.047565858160115 | -1.839 | -1.653 | -1.755 |
| 6.050707450813704 | -1.833 | -1.643 | -1.712 |
| 6.053849043467294 | -1.827 | -1.633 | -1.674 |
| 6.056990636120884 | -1.821 | -1.623 | -1.642 |
| 6.060132228774473 | -1.816 | -1.614 | -1.613 |
| 6.063273821428063 | -1.81 | -1.604 | -1.587 |
| 6.066415414081653 | -1.804 | -1.595 | -1.564 |
| 6.069557006735242 | -1.799 | -1.587 | -1.542 |
| 6.072698599388831 | -1.794 | -1.578 | -1.522 |
| 6.07584019204242 | -1.788 | -1.57 | -1.504 |
| 6.078981784696011 | -1.783 | -1.562 | -1.486 |
| 6.082123377349601 | -1.778 | -1.554 | -1.47 |
| 6.08526497000319 | -1.772 | -1.546 | -1.455 |
| 6.08840656265678 | -1.767 | -1.538 | -1.441 |
| 6.09154815531037 | -1.762 | -1.531 | -1.427 |
| 6.094689747963959 | -1.757 | -1.524 | -1.414 |
| 6.097831340617549 | -1.752 | -1.517 | -1.402 |
| 6.100972933271138 | -1.747 | -1.51 | -1.391 |
| 6.104114525924728 | -1.742 | -1.503 | -1.379 |
| 6.107256118578317 | -1.737 | -1.496 | -1.369 |
| 6.110397711231907 | -1.733 | -1.49 | -1.358 |
| 6.113539303885497 | -1.728 | -1.483 | -1.349 |
| 6.116680896539086 | -1.723 | -1.477 | -1.339 |
| 6.119822489192675 | -1.718 | -1.471 | -1.33 |
| 6.122964081846265 | -1.714 | -1.465 | -1.321 |
| 6.126105674499855 | -1.709 | -1.459 | -1.313 |
| 6.129247267153445 | -1.705 | -1.453 | -1.304 |
| 6.132388859807034 | -1.7 | -1.447 | -1.296 |
| 6.135530452460624 | -1.696 | -1.441 | -1.289 |
| 6.138672045114213 | -1.691 | -1.436 | -1.281 |
| 6.141813637767803 | -1.687 | -1.43 | -1.274 |
| 6.144955230421393 | -1.682 | -1.425 | -1.267 |
| 6.148096823074982 | -1.678 | -1.42 | -1.26 |
| 6.151238415728571 | -1.674 | -1.414 | -1.253 |
| 6.154380008382161 | -1.67 | -1.409 | -1.246 |
| 6.157521601035751 | -1.665 | -1.404 | -1.24 |
| 6.16066319368934 | -1.661 | -1.399 | -1.234 |
| 6.16380478634293 | -1.657 | -1.394 | -1.228 |
| 6.16694637899652 | -1.653 | -1.389 | -1.222 |
| 6.170087971650109 | -1.649 | -1.385 | -1.216 |
| 6.173229564303698 | -1.645 | -1.38 | -1.21 |
| 6.176371156957289 | -1.641 | -1.375 | -1.205 |
| 6.179512749610878 | -1.637 | -1.371 | -1.199 |
| 6.182654342264468 | -1.633 | -1.366 | -1.194 |
| 6.185795934918057 | -1.629 | -1.362 | -1.189 |
| 6.188937527571647 | -1.625 | -1.357 | -1.184 |
| 6.192079120225237 | -1.621 | -1.353 | -1.179 |
| 6.195220712878826 | -1.617 | -1.349 | -1.174 |
| 6.198362305532415 | -1.614 | -1.344 | -1.169 |
| 6.201503898186005 | -1.61 | -1.34 | -1.164 |
| 6.204645490839594 | -1.606 | -1.336 | -1.16 |
| 6.207787083493184 | -1.602 | -1.332 | -1.155 |
| 6.210928676146774 | -1.599 | -1.328 | -1.151 |
| 6.214070268800364 | -1.595 | -1.324 | -1.146 |
| 6.217211861453953 | -1.591 | -1.32 | -1.142 |
| 6.220353454107543 | -1.588 | -1.316 | -1.138 |
| 6.223495046761133 | -1.584 | -1.312 | -1.134 |
| 6.226636639414722 | -1.581 | -1.308 | -1.13 |
| 6.229778232068312 | -1.577 | -1.305 | -1.126 |
| 6.232919824721901 | -1.574 | -1.301 | -1.122 |
| 6.236061417375491 | -1.57 | -1.297 | -1.118 |
| 6.23920301002908 | -1.567 | -1.294 | -1.114 |
| 6.24234460268267 | -1.563 | -1.29 | -1.11 |
| 6.24548619533626 | -1.56 | -1.286 | -1.106 |
| 6.24862778798985 | -1.557 | -1.283 | -1.103 |
| 6.251769380643438 | -1.553 | -1.279 | -1.099 |
| 6.254910973297028 | -1.55 | -1.276 | -1.096 |
| 6.258052565950618 | -1.546 | -1.273 | -1.092 |
| 6.261194158604208 | -1.543 | -1.269 | -1.089 |
| 6.264335751257797 | -1.54 | -1.266 | -1.085 |
| 6.267477343911387 | -1.537 | -1.263 | -1.082 |
| 6.270618936564976 | -1.533 | -1.259 | -1.078 |
| 6.273760529218566 | -1.53 | -1.256 | -1.075 |
| 6.276902121872155 | -1.527 | -1.253 | -1.072 |
| 6.280043714525745 | -1.524 | -1.25 | -1.069 |
| 6.283185307179335 | -1.521 | -1.246 | -1.066 |